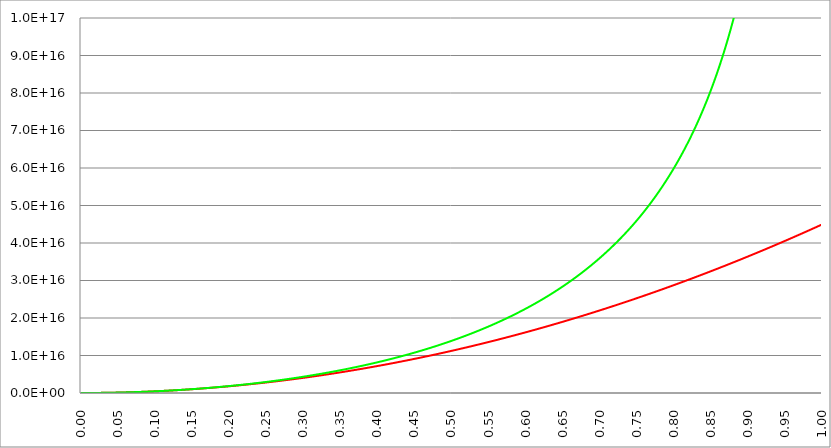
| Category | Series 1 | Series 0 | Series 2 |
|---|---|---|---|
| 0.0 | 0 | 0 |  |
| 0.0005 | 11234439734.21 | 11234441841.178 |  |
| 0.001 | 44937758936.841 | 44937792629.481 |  |
| 0.0015 | 101109957607.892 | 101110128219.087 |  |
| 0.002 | 179751035747.364 | 179751574993.71 |  |
| 0.0025 | 280860993355.255 | 280862309906.519 |  |
| 0.003 | 404439830431.568 | 404442560420.262 |  |
| 0.0035 | 550487546976.301 | 550492604627.008 |  |
| 0.004 | 719004142989.454 | 719012771148.367 |  |
| 0.0045 | 909989618471.028 | 910003439175.398 |  |
| 0.005 | 1123443973421.02 | 1123465038448.66 |  |
| 0.0055 | 1359367207839.44 | 1359398049258.19 |  |
| 0.006 | 1617759321726.27 | 1617803002543.33 |  |
| 0.0065 | 1898620315081.53 | 1898680479733.02 |  |
| 0.007 | 2201950187905.21 | 2202031112885.54 |  |
| 0.0075 | 2527748940197.3 | 2527855584608.65 |  |
| 0.008 | 2876016571957.82 | 2876154628119.5 |  |
| 0.0085 | 3246753083186.76 | 3246929027224.61 |  |
| 0.009 | 3639958473884.11 | 3640179616280.02 |  |
| 0.0095 | 4055632744049.89 | 4055907280330.96 |  |
| 0.01 | 4493775893684.09 | 4494112954972.15 |  |
| 0.0105 | 4954387922786.71 | 4954797626387.7 |  |
| 0.011 | 5437468831357.75 | 5437962331411.04 |  |
| 0.0115 | 5943018619397.21 | 5943608157524.83 |  |
| 0.012 | 6471037286905.09 | 6471736242801.16 |  |
| 0.0125 | 7021524833881.4 | 7022347775981.37 |  |
| 0.013 | 7594481260326.12 | 7595443996416.13 |  |
| 0.0135 | 8189906566239.26 | 8191026194145.31 |  |
| 0.014 | 8807800751620.82 | 8809095709838.12 |  |
| 0.0145 | 9448163816470.81 | 9449653934892.85 |  |
| 0.015 | 10110995760789.2 | 10112702311317.2 |  |
| 0.0155 | 10796296584576 | 10798242331827.9 |  |
| 0.016 | 11504066287831.3 | 11506275539870.9 |  |
| 0.0165 | 12234304870554.9 | 12236803529581.3 |  |
| 0.017 | 12987012332747 | 12989827945763.5 |  |
| 0.0175 | 13762188674407.5 | 13765350484050.6 |  |
| 0.018 | 14559833895536.5 | 14563372890725.1 |  |
| 0.0185 | 15379947996133.8 | 15383896962838.6 |  |
| 0.019 | 16222530976199.6 | 16226924548211.6 |  |
| 0.0195 | 17087582835733.8 | 17092457545453.6 |  |
| 0.02 | 17975103574736.4 | 17980497903943.1 |  |
| 0.0205 | 18885093193207.4 | 18891047623847.5 |  |
| 0.021 | 19817551691146.9 | 19824108756143.4 |  |
| 0.0215 | 20772479068554.7 | 20779683402615.9 |  |
| 0.022 | 21749875325431 | 21757773715919.3 |  |
| 0.0225 | 22749740461775.7 | 22758381899536.6 |  |
| 0.023 | 23772074477588.9 | 23781510207819.6 |  |
| 0.0235 | 24816877372870.4 | 24827160945968.9 |  |
| 0.024 | 25884149147620.4 | 25895336470094 |  |
| 0.0245 | 26973889801838.8 | 26986039187232.8 |  |
| 0.025 | 28086099335525.6 | 28099271555292.1 |  |
| 0.0255 | 29220777748680.8 | 29235036083167.5 |  |
| 0.026 | 30377925041304.5 | 30393335330682.8 |  |
| 0.0265 | 31557541213396.6 | 31574171908590.8 |  |
| 0.027 | 32759626264957 | 32777548478692.5 |  |
| 0.0275 | 33984180195986 | 34003467753757.7 |  |
| 0.028 | 35231203006483.3 | 35251932497564.6 |  |
| 0.0285 | 36500694696449.1 | 36522945524939.6 |  |
| 0.029 | 37792655265883.2 | 37816509701757.9 |  |
| 0.0295 | 39107084714785.8 | 39132627944982.6 |  |
| 0.03 | 40443983043156.8 | 40471303222625.5 |  |
| 0.0305 | 41803350250996.3 | 41832538553806.6 |  |
| 0.031 | 43185186338304.1 | 43216337008853.8 |  |
| 0.0315 | 44589491305080.4 | 44622701709123.8 |  |
| 0.032 | 46016265151325.1 | 46051635827220.8 |  |
| 0.0325 | 47465507877038.2 | 47503142586897.6 |  |
| 0.033 | 48937219482219.8 | 48977225263134.8 |  |
| 0.0335 | 50431399966869.7 | 50473887182081.2 |  |
| 0.034 | 51948049330988.1 | 51993131721233.3 |  |
| 0.0345 | 53487167574574.9 | 53534962309235.8 |  |
| 0.035 | 55048754697630.2 | 55099382426121.2 |  |
| 0.0355 | 56632810700153.8 | 56686395603189.7 |  |
| 0.036 | 58239335582145.9 | 58296005423069.5 |  |
| 0.0365 | 59868329343606.3 | 59928215519756.3 |  |
| 0.037 | 61519791984535.2 | 61583029578633.7 |  |
| 0.0375 | 63193723504932.6 | 63260451336452.7 |  |
| 0.038 | 64890123904798.3 | 64960484581432.2 |  |
| 0.0385 | 66608993184132.5 | 66683133153218.2 |  |
| 0.039 | 68350331342935.1 | 68428400942904.7 |  |
| 0.0395 | 70114138381206.1 | 70196291893152.6 |  |
| 0.04 | 71900414298945.5 | 71986809998050.5 |  |
| 0.0405 | 73709159096153.4 | 73799959303334.3 |  |
| 0.041 | 75540372772829.6 | 75635743906226.9 |  |
| 0.0415 | 77394055328974.3 | 77494167955618.8 |  |
| 0.042 | 79270206764587.4 | 79375235651967.2 |  |
| 0.0425 | 81168827079669 | 81278951247416.8 |  |
| 0.043 | 83089916274218.9 | 83205319045759 |  |
| 0.0435 | 85033474348237.3 | 85154343402552.5 |  |
| 0.044 | 86999501301724.1 | 87126028725022.5 |  |
| 0.0445 | 88987997134679.3 | 89120379472161.4 |  |
| 0.045 | 90998961847103 | 91137400154788.2 |  |
| 0.0455 | 93032395438995 | 93177095335508.8 |  |
| 0.046 | 95088297910355.5 | 95239469628795.5 |  |
| 0.0465 | 97166669261184.3 | 97324527700987.3 |  |
| 0.047 | 99267509491481.6 | 99432274270270 |  |
| 0.0475 | 101390818601247 | 101562714106875 |  |
| 0.048 | 103536596590482 | 103715852032922 |  |
| 0.0485 | 105704843459184 | 105891692922535 |  |
| 0.049 | 107895559207355 | 108090241701845 |  |
| 0.0495 | 110108743834995 | 110311503349089 |  |
| 0.05 | 112344397342102 | 112555482894551 |  |
| 0.0505 | 114602519728679 | 114822185420680 |  |
| 0.051 | 116883110994723 | 117111616061992 |  |
| 0.0515 | 119186171140236 | 119423780005248 |  |
| 0.052 | 121511700165218 | 121758682489455 |  |
| 0.0525 | 123859698069668 | 124116328805786 |  |
| 0.053 | 126230164853586 | 126496724297761 |  |
| 0.0535 | 128623100516973 | 128899874361202 |  |
| 0.054 | 131038505059828 | 131325784444261 |  |
| 0.0545 | 133476378482152 | 133774460047472 |  |
| 0.055 | 135936720783944 | 136245906723857 |  |
| 0.0555 | 138419531965204 | 138740130078801 |  |
| 0.056 | 140924812025933 | 141257135770216 |  |
| 0.0565 | 143452560966131 | 143796929508579 |  |
| 0.057 | 146002778785796 | 146359517056870 |  |
| 0.0575 | 148575465484930 | 148944904230697 |  |
| 0.058 | 151170621063533 | 151553096898312 |  |
| 0.0585 | 153788245521604 | 154184100980610 |  |
| 0.059 | 156428338859143 | 156837922451233 |  |
| 0.0595 | 159090901076151 | 159514567336526 |  |
| 0.06 | 161775932172627 | 162214041715681 |  |
| 0.0605 | 164483432148572 | 164936351720653 |  |
| 0.061 | 167213401003985 | 167681503536300 |  |
| 0.0615 | 169965838738867 | 170449503400367 |  |
| 0.062 | 172740745353217 | 173240357603541 |  |
| 0.0625 | 175538120847035 | 176054072489515 |  |
| 0.063 | 178357965220322 | 178890654454966 |  |
| 0.0635 | 181200278473077 | 181750109949653 |  |
| 0.064 | 184065060605300 | 184632445476461 |  |
| 0.0645 | 186952311616993 | 187537667591397 |  |
| 0.065 | 189862031508153 | 190465782903655 |  |
| 0.0655 | 192794220278782 | 193416798075628 |  |
| 0.066 | 195748877928879 | 196390719823077 |  |
| 0.0665 | 198726004458445 | 199387554914963 |  |
| 0.067 | 201725599867479 | 202407310173673 |  |
| 0.0675 | 204747664155982 | 205449992474995 |  |
| 0.068 | 207792197323953 | 208515608748101 |  |
| 0.0685 | 210859199371392 | 211604165975747 |  |
| 0.069 | 213948670298300 | 214715671194132 |  |
| 0.0695 | 217060610104676 | 217850131493075 |  |
| 0.07 | 220195018790521 | 221007554016022 |  |
| 0.0705 | 223351896355834 | 224187945960098 |  |
| 0.071 | 226531242800615 | 227391314576074 |  |
| 0.0715 | 229733058124865 | 230617667168579 |  |
| 0.072 | 232957342328583 | 233867011095970 |  |
| 0.0725 | 236204095411770 | 237139353770501 |  |
| 0.073 | 239473317374425 | 240434702658311 |  |
| 0.0735 | 242765008216549 | 243753065279482 |  |
| 0.074 | 246079167938141 | 247094449208134 |  |
| 0.0745 | 249415796539201 | 250458862072373 |  |
| 0.075 | 252774894019730 | 253846311554424 |  |
| 0.0755 | 256156460379728 | 257256805390696 |  |
| 0.076 | 259560495619193 | 260690351371698 |  |
| 0.0765 | 262986999738127 | 264146957342280 |  |
| 0.077 | 266435972736530 | 267626631201533 |  |
| 0.0775 | 269907414614401 | 271129380902893 |  |
| 0.078 | 273401325371740 | 274655214454192 |  |
| 0.0785 | 276917705008548 | 278204139917705 |  |
| 0.079 | 280456553524824 | 281776165410250 |  |
| 0.0795 | 284017870920569 | 285371299103103 |  |
| 0.08 | 287601657195782 | 288989549222201 |  |
| 0.0805 | 291207912350464 | 292630924048162 |  |
| 0.081 | 294836636384613 | 296295431916245 |  |
| 0.0815 | 298487829298232 | 299983081216509 |  |
| 0.082 | 302161491091318 | 303693880393812 |  |
| 0.0825 | 305857621763874 | 307427837947874 |  |
| 0.083 | 309576221315897 | 311184962433392 |  |
| 0.0835 | 313317289747389 | 314965262459967 |  |
| 0.084 | 317080827058350 | 318768746692256 |  |
| 0.0845 | 320866833248779 | 322595423850037 |  |
| 0.085 | 324675308318676 | 326445302708208 |  |
| 0.0855 | 328506252268041 | 330318392096845 |  |
| 0.086 | 332359665096876 | 334214700901344 |  |
| 0.0865 | 336235546805178 | 338134238062361 |  |
| 0.087 | 340133897392949 | 342077012575950 |  |
| 0.0875 | 344054716860188 | 346043033493582 |  |
| 0.088 | 347998005206896 | 350032309922230 |  |
| 0.0885 | 351963762433072 | 354044851024423 |  |
| 0.089 | 355951988538717 | 358080666018251 |  |
| 0.0895 | 359962683523830 | 362139764177519 |  |
| 0.09 | 363995847388412 | 366222154831754 |  |
| 0.0905 | 368051480132462 | 370327847366237 |  |
| 0.091 | 372129581755980 | 374456851222130 |  |
| 0.0915 | 376230152258967 | 378609175896472 |  |
| 0.092 | 380353191641422 | 382784830942318 |  |
| 0.0925 | 384498699903345 | 386983825968683 |  |
| 0.093 | 388666677044737 | 391206170640759 |  |
| 0.0935 | 392857123065598 | 395451874679813 |  |
| 0.094 | 397070037965927 | 399720947863371 |  |
| 0.0945 | 401305421745724 | 404013400025256 |  |
| 0.095 | 405563274404990 | 408329241055607 |  |
| 0.0955 | 409843595943724 | 412668480900980 |  |
| 0.096 | 414146386361926 | 417031129564408 |  |
| 0.0965 | 418471645659597 | 421417197105459 |  |
| 0.097 | 422819373836736 | 425826693640320 |  |
| 0.0975 | 427189570893344 | 430259629341811 |  |
| 0.098 | 431582236829420 | 434716014439530 |  |
| 0.0985 | 435997371644965 | 439195859219831 |  |
| 0.099 | 440434975339978 | 443699174026001 |  |
| 0.0995 | 444895047914460 | 448225969258205 |  |
| 0.1 | 449377589368409 | 452776255373624 |  |
| 0.1005 | 453882599701828 | 457350042886511 |  |
| 0.101 | 458410078914715 | 461947342368298 |  |
| 0.1015 | 462960027007070 | 466568164447570 |  |
| 0.102 | 467532443978893 | 471212519810185 |  |
| 0.1025 | 472127329830185 | 475880419199420 |  |
| 0.103 | 476744684560946 | 480571873415901 |  |
| 0.1035 | 481384508171174 | 485286893317754 |  |
| 0.104 | 486046800660872 | 490025489820696 |  |
| 0.1045 | 490731562030037 | 494787673898037 |  |
| 0.105 | 495438792278672 | 499573456580803 |  |
| 0.1055 | 500168491406774 | 504382848957794 |  |
| 0.106 | 504920659414345 | 509215862175642 |  |
| 0.1065 | 509695296301384 | 514072507438932 |  |
| 0.107 | 514492402067892 | 518952796010185 |  |
| 0.1075 | 519311976713868 | 523856739210052 |  |
| 0.108 | 524154020239313 | 528784348417259 |  |
| 0.1085 | 529018532644226 | 533735635068783 |  |
| 0.109 | 533905513928607 | 538710610659895 |  |
| 0.1095 | 538814964092457 | 543709286744198 |  |
| 0.11 | 543746883135776 | 548731674933767 |  |
| 0.1105 | 548701271058562 | 553777786899189 |  |
| 0.111 | 553678127860817 | 558847634369603 |  |
| 0.1115 | 558677453542541 | 563941229132881 |  |
| 0.112 | 563699248103733 | 569058583035565 |  |
| 0.1125 | 568743511544393 | 574199707983089 |  |
| 0.113 | 573810243864522 | 579364615939777 |  |
| 0.1135 | 578899445064119 | 584553318928886 |  |
| 0.114 | 584011115143185 | 589765829032803 |  |
| 0.1145 | 589145254101720 | 595002158392986 |  |
| 0.115 | 594301861939721 | 600262319210143 |  |
| 0.1155 | 599480938657192 | 605546323744333 |  |
| 0.116 | 604682484254132 | 610854184314885 |  |
| 0.1165 | 609906498730540 | 616185913300677 |  |
| 0.117 | 615152982086416 | 621541523140079 |  |
| 0.1175 | 620421934321760 | 626921026331148 |  |
| 0.118 | 625713355436573 | 632324435431614 |  |
| 0.1185 | 631027245430855 | 637751763058931 |  |
| 0.119 | 636363604304605 | 643203021890548 |  |
| 0.1195 | 641722432057823 | 648678224663819 |  |
| 0.12 | 647103728690510 | 654177384176088 |  |
| 0.1205 | 652507494202665 | 659700513284908 |  |
| 0.121 | 657933728594288 | 665247624907999 |  |
| 0.1215 | 663382431865380 | 670818732023371 |  |
| 0.122 | 668853604015941 | 676413847669461 |  |
| 0.1225 | 674347245045969 | 682032984945113 |  |
| 0.123 | 679863354955467 | 687676157009780 |  |
| 0.1235 | 685401933744432 | 693343377083522 |  |
| 0.124 | 690962981412866 | 699034658447185 |  |
| 0.1245 | 696546497960769 | 704750014442366 |  |
| 0.125 | 702152483388140 | 710489458471583 |  |
| 0.1255 | 707780937694979 | 716253003998426 |  |
| 0.126 | 713431860881287 | 722040664547467 |  |
| 0.1265 | 719105252947063 | 727852453704528 |  |
| 0.127 | 724801113892307 | 733688385116655 |  |
| 0.1275 | 730519443717021 | 739548472492261 |  |
| 0.128 | 736260242421202 | 745432729601243 |  |
| 0.1285 | 742023510004852 | 751341170274984 |  |
| 0.129 | 747809246467970 | 757273808406555 |  |
| 0.1295 | 753617451810557 | 763230657950688 |  |
| 0.13 | 759448126032612 | 769211732924022 |  |
| 0.1305 | 765301269134136 | 775217047405021 |  |
| 0.131 | 771176881115127 | 781246615534192 |  |
| 0.1315 | 777074961975588 | 787300451514148 |  |
| 0.132 | 782995511715516 | 793378569609723 |  |
| 0.1325 | 788938530334914 | 799480984147979 |  |
| 0.133 | 794904017833779 | 805607709518419 |  |
| 0.1335 | 800891974212113 | 811758760173009 |  |
| 0.134 | 806902399469916 | 817934150626280 |  |
| 0.1345 | 812935293607187 | 824133895455485 |  |
| 0.135 | 818990656623926 | 830358009300620 |  |
| 0.1355 | 825068488520134 | 836606506864563 |  |
| 0.136 | 831168789295810 | 842879402913154 |  |
| 0.1365 | 837291558950954 | 849176712275317 |  |
| 0.137 | 843436797485568 | 855498449843177 |  |
| 0.1375 | 849604504899650 | 861844630572079 |  |
| 0.138 | 855794681193199 | 868215269480753 |  |
| 0.1385 | 862007326366217 | 874610381651446 |  |
| 0.139 | 868242440418704 | 881029982229909 |  |
| 0.1395 | 874500023350659 | 887474086425633 |  |
| 0.14 | 880780075162082 | 893942709511870 |  |
| 0.1405 | 887082595852974 | 900435866825751 |  |
| 0.141 | 893407585423335 | 906953573768388 |  |
| 0.1415 | 899755043873163 | 913495845804994 |  |
| 0.142 | 906124971202461 | 920062698464979 |  |
| 0.1425 | 912517367411226 | 926654147342036 |  |
| 0.143 | 918932232499460 | 933270208094293 |  |
| 0.1435 | 925369566467163 | 939910896444361 |  |
| 0.144 | 931829369314334 | 946576228179506 |  |
| 0.1445 | 938311641040973 | 953266219151696 |  |
| 0.145 | 944816381647081 | 959980885277714 |  |
| 0.1455 | 951343591132657 | 966720242539305 |  |
| 0.146 | 957893269497701 | 973484306983288 |  |
| 0.1465 | 964465416742214 | 980273094721621 |  |
| 0.147 | 971060032866196 | 987086621931500 |  |
| 0.1475 | 977677117869646 | 993924904855537 |  |
| 0.148 | 984316671752564 | 1000787959801820 |  |
| 0.1485 | 990978694514951 | 1007675803144060 |  |
| 0.149 | 997663186156806 | 1014588451321630 |  |
| 0.1495 | 1004370146678130 | 1021525920839780 |  |
| 0.15 | 1011099576078920 | 1028488228269650 |  |
| 0.1505 | 1017851474359180 | 1035475390248490 |  |
| 0.151 | 1024625841518910 | 1042487423479660 |  |
| 0.1515 | 1031422677558110 | 1049524344732800 |  |
| 0.152 | 1038241982476770 | 1056586170843980 |  |
| 0.1525 | 1045083756274910 | 1063672918715720 |  |
| 0.153 | 1051947998952510 | 1070784605317240 |  |
| 0.1535 | 1058834710509580 | 1077921247684410 |  |
| 0.154 | 1065743890946120 | 1085082862920040 |  |
| 0.1545 | 1072675540262130 | 1092269468193880 |  |
| 0.155 | 1079629658457600 | 1099481080742750 |  |
| 0.1555 | 1086606245532550 | 1106717717870690 |  |
| 0.156 | 1093605301486960 | 1113979396949080 |  |
| 0.1565 | 1100626826320840 | 1121266135416770 |  |
| 0.157 | 1107670820034190 | 1128577950780110 |  |
| 0.1575 | 1114737282627010 | 1135914860613220 |  |
| 0.158 | 1121826214099300 | 1143276882557960 |  |
| 0.1585 | 1128937614451050 | 1150664034324180 |  |
| 0.159 | 1136071483682280 | 1158076333689730 |  |
| 0.1595 | 1143227821792970 | 1165513798500690 |  |
| 0.16 | 1150406628783130 | 1172976446671370 |  |
| 0.1605 | 1157607904652760 | 1180464296184580 |  |
| 0.161 | 1164831649401850 | 1187977365091630 |  |
| 0.1615 | 1172077863030420 | 1195515671512480 |  |
| 0.162 | 1179346545538450 | 1203079233635980 |  |
| 0.1625 | 1186637696925960 | 1210668069719810 |  |
| 0.163 | 1193951317192930 | 1218282198090730 |  |
| 0.1635 | 1201287406339370 | 1225921637144730 |  |
| 0.164 | 1208645964365270 | 1233586405346970 |  |
| 0.1645 | 1216026991270650 | 1241276521232230 |  |
| 0.165 | 1223430487055490 | 1248992003404700 |  |
| 0.1655 | 1230856451719810 | 1256732870538290 |  |
| 0.166 | 1238304885263590 | 1264499141376820 |  |
| 0.1665 | 1245775787686840 | 1272290834733940 |  |
| 0.167 | 1253269158989560 | 1280107969493500 |  |
| 0.1675 | 1260784999171740 | 1287950564609430 |  |
| 0.168 | 1268323308233400 | 1295818639106170 |  |
| 0.1685 | 1275884086174520 | 1303712212078480 |  |
| 0.169 | 1283467332995110 | 1311631302691850 |  |
| 0.1695 | 1291073048695170 | 1319575930182460 |  |
| 0.17 | 1298701233274700 | 1327546113857380 |  |
| 0.1705 | 1306351886733700 | 1335541873094710 |  |
| 0.171 | 1314025009072170 | 1343563227343670 |  |
| 0.1715 | 1321720600290100 | 1351610196124830 |  |
| 0.172 | 1329438660387500 | 1359682799030110 |  |
| 0.1725 | 1337179189364370 | 1367781055723080 |  |
| 0.173 | 1344942187220710 | 1375904985938920 |  |
| 0.1735 | 1352727653956520 | 1384054609484680 |  |
| 0.174 | 1360535589571800 | 1392229946239470 |  |
| 0.1745 | 1368365994066540 | 1400431016154400 |  |
| 0.175 | 1376218867440750 | 1408657839252910 |  |
| 0.1755 | 1384094209694440 | 1416910435630820 |  |
| 0.176 | 1391992020827590 | 1425188825456460 |  |
| 0.1765 | 1399912300840200 | 1433493028970930 |  |
| 0.177 | 1407855049732290 | 1441823066488080 |  |
| 0.1775 | 1415820267503850 | 1450178958394780 |  |
| 0.178 | 1423807954154870 | 1458560725150970 |  |
| 0.1785 | 1431818109685360 | 1466968387289860 |  |
| 0.179 | 1439850734095320 | 1475401965418130 |  |
| 0.1795 | 1447905827384750 | 1483861480215900 |  |
| 0.18 | 1455983389553650 | 1492346952437100 |  |
| 0.1805 | 1464083420602010 | 1500858402909440 |  |
| 0.181 | 1472205920529850 | 1509395852534630 |  |
| 0.1815 | 1480350889337150 | 1517959322288510 |  |
| 0.182 | 1488518327023920 | 1526548833221280 |  |
| 0.1825 | 1496708233590160 | 1535164406457490 |  |
| 0.183 | 1504920609035870 | 1543806063196330 |  |
| 0.1835 | 1513155453361040 | 1552473824711740 |  |
| 0.184 | 1521412766565690 | 1561167712352520 |  |
| 0.1845 | 1529692548649800 | 1569887747542550 |  |
| 0.185 | 1537994799613380 | 1578633951780850 |  |
| 0.1855 | 1546319519456430 | 1587406346641900 |  |
| 0.186 | 1554666708178950 | 1596204953775600 |  |
| 0.1865 | 1563036365780940 | 1605029794907520 |  |
| 0.187 | 1571428492262390 | 1613880891839090 |  |
| 0.1875 | 1579843087623310 | 1622758266447640 |  |
| 0.188 | 1588280151863710 | 1631661940686740 |  |
| 0.1885 | 1596739684983570 | 1640591936586130 |  |
| 0.189 | 1605221686982900 | 1649548276252070 |  |
| 0.1895 | 1613726157861690 | 1658530981867440 |  |
| 0.19 | 1622253097619960 | 1667540075691800 |  |
| 0.1905 | 1630802506257690 | 1676575580061740 |  |
| 0.191 | 1639374383774890 | 1685637517390850 |  |
| 0.1915 | 1647968730171570 | 1694725910169990 |  |
| 0.192 | 1656585545447700 | 1703840780967460 |  |
| 0.1925 | 1665224829603310 | 1712982152429140 |  |
| 0.193 | 1673886582638390 | 1722150047278580 |  |
| 0.1935 | 1682570804552930 | 1731344488317270 |  |
| 0.194 | 1691277495346950 | 1740565498424810 |  |
| 0.1945 | 1700006655020430 | 1749813100558950 |  |
| 0.195 | 1708758283573380 | 1759087317755890 |  |
| 0.1955 | 1717532381005800 | 1768388173130360 |  |
| 0.196 | 1726328947317680 | 1777715689875860 |  |
| 0.1965 | 1735147982509040 | 1787069891264770 |  |
| 0.197 | 1743989486579860 | 1796450800648560 |  |
| 0.1975 | 1752853459530150 | 1805858441457880 |  |
| 0.198 | 1761739901359910 | 1815292837202890 |  |
| 0.1985 | 1770648812069140 | 1824754011473240 |  |
| 0.199 | 1779580191657840 | 1834241987938390 |  |
| 0.1995 | 1788534040126000 | 1843756790347690 |  |
| 0.2 | 1797510357473640 | 1853298442530600 |  |
| 0.2005 | 1806509143700740 | 1862866968396870 |  |
| 0.201 | 1815530398807310 | 1872462391936690 |  |
| 0.2015 | 1824574122793350 | 1882084737220890 |  |
| 0.202 | 1833640315658860 | 1891734028401030 |  |
| 0.2025 | 1842728977403830 | 1901410289709740 |  |
| 0.203 | 1851840108028280 | 1911113545460780 |  |
| 0.2035 | 1860973707532190 | 1920843820049200 |  |
| 0.204 | 1870129775915570 | 1930601137951610 |  |
| 0.2045 | 1879308313178420 | 1940385523726290 |  |
| 0.205 | 1888509319320740 | 1950197002013400 |  |
| 0.2055 | 1897732794342530 | 1960035597535160 |  |
| 0.206 | 1906978738243780 | 1969901335096020 |  |
| 0.2065 | 1916247151024510 | 1979794239582870 |  |
| 0.207 | 1925538032684700 | 1989714335965170 |  |
| 0.2075 | 1934851383224360 | 1999661649295190 |  |
| 0.208 | 1944187202643490 | 2009636204708170 |  |
| 0.2085 | 1953545490942080 | 2019638027422530 |  |
| 0.209 | 1962926248120150 | 2029667142739990 |  |
| 0.2095 | 1972329474177680 | 2039723576045860 |  |
| 0.21 | 1981755169114690 | 2049807352809110 |  |
| 0.2105 | 1991203332931160 | 2059918498582700 |  |
| 0.211 | 2000673965627100 | 2070057039003600 |  |
| 0.2115 | 2010167067202500 | 2080222999793160 |  |
| 0.212 | 2019682637657380 | 2090416406757140 |  |
| 0.2125 | 2029220676991720 | 2100637285786060 |  |
| 0.213 | 2038781185205540 | 2110885662855210 |  |
| 0.2135 | 2048364162298820 | 2121161564024990 |  |
| 0.214 | 2057969608271570 | 2131465015441110 |  |
| 0.2145 | 2067597523123790 | 2141796043334620 |  |
| 0.215 | 2077247906855470 | 2152154674022320 |  |
| 0.2155 | 2086920759466630 | 2162540933906770 |  |
| 0.216 | 2096616080957250 | 2172954849476690 |  |
| 0.2165 | 2106333871327340 | 2183396447306910 |  |
| 0.217 | 2116074130576900 | 2193865754058790 |  |
| 0.2175 | 2125836858705930 | 2204362796480280 |  |
| 0.218 | 2135622055714430 | 2214887601406220 |  |
| 0.2185 | 2145429721602390 | 2225440195758450 |  |
| 0.219 | 2155259856369830 | 2236020606546100 |  |
| 0.2195 | 2165112460016730 | 2246628860865740 |  |
| 0.22 | 2174987532543100 | 2257264985901530 |  |
| 0.2205 | 2184885073948940 | 2267929008925580 |  |
| 0.221 | 2194805084234250 | 2278620957298040 |  |
| 0.2215 | 2204747563399020 | 2289340858467310 |  |
| 0.222 | 2214712511443270 | 2300088739970290 |  |
| 0.2225 | 2224699928366980 | 2310864629432560 |  |
| 0.223 | 2234709814170160 | 2321668554568610 |  |
| 0.2235 | 2244742168852810 | 2332500543182040 |  |
| 0.224 | 2254796992414930 | 2343360623165730 |  |
| 0.2245 | 2264874284856520 | 2354248822502140 |  |
| 0.225 | 2274974046177570 | 2365165169263480 |  |
| 0.2255 | 2285096276378100 | 2376109691611900 |  |
| 0.226 | 2295240975458090 | 2387082417799700 |  |
| 0.2265 | 2305408143417550 | 2398083376169590 |  |
| 0.227 | 2315597780256480 | 2409112595154890 |  |
| 0.2275 | 2325809885974870 | 2420170103279750 |  |
| 0.228 | 2336044460572740 | 2431255929159350 |  |
| 0.2285 | 2346301504050070 | 2442370101500100 |  |
| 0.229 | 2356581016406880 | 2453512649099980 |  |
| 0.2295 | 2366882997643150 | 2464683600848530 |  |
| 0.23 | 2377207447758890 | 2475882985727340 |  |
| 0.2305 | 2387554366754090 | 2487110832810100 |  |
| 0.231 | 2397923754628770 | 2498367171262830 |  |
| 0.2315 | 2408315611382910 | 2509652030344190 |  |
| 0.232 | 2418729937016530 | 2520965439405620 |  |
| 0.2325 | 2429166731529610 | 2532307427891660 |  |
| 0.233 | 2439625994922160 | 2543678025340070 |  |
| 0.2335 | 2450107727194180 | 2555077261382140 |  |
| 0.234 | 2460611928345660 | 2566505165742850 |  |
| 0.2345 | 2471138598376620 | 2577961768241160 |  |
| 0.235 | 2481687737287040 | 2589447098790220 |  |
| 0.2355 | 2492259345076930 | 2600961187397620 |  |
| 0.236 | 2502853421746290 | 2612504064165580 |  |
| 0.2365 | 2513469967295120 | 2624075759291190 |  |
| 0.237 | 2524108981723420 | 2635676303066680 |  |
| 0.2375 | 2534770465031190 | 2647305725879640 |  |
| 0.238 | 2545454417218420 | 2658964058213290 |  |
| 0.2385 | 2556160838285120 | 2670651330646580 |  |
| 0.239 | 2566889728231290 | 2682367573854640 |  |
| 0.2395 | 2577641087056930 | 2694112818608830 |  |
| 0.24 | 2588414914762040 | 2705887095777090 |  |
| 0.2405 | 2599211211346610 | 2717690436324160 |  |
| 0.241 | 2610029976810660 | 2729522871311830 |  |
| 0.2415 | 2620871211154170 | 2741384431899100 |  |
| 0.242 | 2631734914377150 | 2753275149342540 |  |
| 0.2425 | 2642621086479600 | 2765195054996470 |  |
| 0.243 | 2653529727461520 | 2777144180313260 |  |
| 0.2435 | 2664460837322910 | 2789122556843450 |  |
| 0.244 | 2675414416063760 | 2801130216236170 |  |
| 0.2445 | 2686390463684090 | 2813167190239320 |  |
| 0.245 | 2697388980183880 | 2825233510699730 |  |
| 0.2455 | 2708409965563140 | 2837329209563530 |  |
| 0.246 | 2719453419821870 | 2849454318876350 |  |
| 0.2465 | 2730519342960060 | 2861608870783620 |  |
| 0.247 | 2741607734977730 | 2873792897530770 |  |
| 0.2475 | 2752718595874860 | 2886006431463450 |  |
| 0.248 | 2763851925651470 | 2898249505027940 |  |
| 0.2485 | 2775007724307540 | 2910522150771220 |  |
| 0.249 | 2786185991843080 | 2922824401341360 |  |
| 0.2495 | 2797386728258080 | 2935156289487750 |  |
| 0.25 | 2808609933552560 | 2947517848061310 |  |
| 0.2505 | 2819855607726500 | 2959909110014810 |  |
| 0.251 | 2831123750779920 | 2972330108403090 |  |
| 0.2515 | 2842414362712800 | 2984780876383390 |  |
| 0.252 | 2853727443525150 | 2997261447215550 |  |
| 0.2525 | 2865062993216970 | 3009771854262250 |  |
| 0.253 | 2876421011788250 | 3022312130989390 |  |
| 0.2535 | 2887801499239010 | 3034882310966280 |  |
| 0.254 | 2899204455569230 | 3047482427865880 |  |
| 0.2545 | 2910629880778920 | 3060112515465150 |  |
| 0.255 | 2922077774868080 | 3072772607645270 |  |
| 0.2555 | 2933548137836710 | 3085462738391940 |  |
| 0.256 | 2945040969684810 | 3098182941795610 |  |
| 0.2565 | 2956556270412370 | 3110933252051800 |  |
| 0.257 | 2968094040019410 | 3123713703461350 |  |
| 0.2575 | 2979654278505910 | 3136524330430750 |  |
| 0.258 | 2991236985871880 | 3149365167472310 |  |
| 0.2585 | 3002842162117320 | 3162236249204550 |  |
| 0.259 | 3014469807242230 | 3175137610352420 |  |
| 0.2595 | 3026119921246600 | 3188069285747590 |  |
| 0.26 | 3037792504130450 | 3201031310328750 |  |
| 0.2605 | 3049487555893760 | 3214023719141880 |  |
| 0.261 | 3061205076536540 | 3227046547340520 |  |
| 0.2615 | 3072945066058790 | 3240099830186120 |  |
| 0.262 | 3084707524460510 | 3253183603048220 |  |
| 0.2625 | 3096492451741700 | 3266297901404830 |  |
| 0.263 | 3108299847902350 | 3279442760842720 |  |
| 0.2635 | 3120129712942470 | 3292618217057620 |  |
| 0.264 | 3131982046862070 | 3305824305854620 |  |
| 0.2645 | 3143856849661130 | 3319061063148370 |  |
| 0.265 | 3155754121339660 | 3332328524963480 |  |
| 0.2655 | 3167673861897650 | 3345626727434680 |  |
| 0.266 | 3179616071335120 | 3358955706807280 |  |
| 0.2665 | 3191580749652050 | 3372315499437320 |  |
| 0.267 | 3203567896848450 | 3385706141791920 |  |
| 0.2675 | 3215577512924320 | 3399127670449650 |  |
| 0.268 | 3227609597879660 | 3412580122100690 |  |
| 0.2685 | 3239664151714470 | 3426063533547300 |  |
| 0.269 | 3251741174428750 | 3439577941703980 |  |
| 0.2695 | 3263840666022490 | 3453123383597850 |  |
| 0.27 | 3275962626495700 | 3466699896368950 |  |
| 0.2705 | 3288107055848390 | 3480307517270530 |  |
| 0.271 | 3300273954080540 | 3493946283669360 |  |
| 0.2715 | 3312463321192150 | 3507616233046060 |  |
| 0.272 | 3324675157183240 | 3521317402995390 |  |
| 0.2725 | 3336909462053800 | 3535049831226570 |  |
| 0.273 | 3349166235803820 | 3548813555563620 |  |
| 0.2735 | 3361445478433310 | 3562608613945660 |  |
| 0.274 | 3373747189942270 | 3576435044427160 |  |
| 0.2745 | 3386071370330700 | 3590292885178340 |  |
| 0.275 | 3398418019598600 | 3604182174485520 |  |
| 0.2755 | 3410787137745960 | 3618102950751300 |  |
| 0.276 | 3423178724772800 | 3632055252495070 |  |
| 0.2765 | 3435592780679100 | 3646039118353140 |  |
| 0.277 | 3448029305464870 | 3660054587079210 |  |
| 0.2775 | 3460488299130110 | 3674101697544630 |  |
| 0.278 | 3472969761674820 | 3688180488738730 |  |
| 0.2785 | 3485473693098990 | 3702290999769160 |  |
| 0.279 | 3498000093402640 | 3716433269862220 |  |
| 0.2795 | 3510548962585750 | 3730607338363220 |  |
| 0.28 | 3523120300648330 | 3744813244736750 |  |
| 0.2805 | 3535714107590380 | 3759051028567040 |  |
| 0.281 | 3548330383411900 | 3773320729558330 |  |
| 0.2815 | 3560969128112880 | 3787622387535190 |  |
| 0.282 | 3573630341693340 | 3801956042442800 |  |
| 0.2825 | 3586314024153260 | 3816321734347350 |  |
| 0.283 | 3599020175492650 | 3830719503436400 |  |
| 0.2835 | 3611748795711510 | 3845149390019160 |  |
| 0.284 | 3624499884809840 | 3859611434526870 |  |
| 0.2845 | 3637273442787640 | 3874105677513170 |  |
| 0.285 | 3650069469644910 | 3888632159654340 |  |
| 0.2855 | 3662887965381640 | 3903190921749810 |  |
| 0.286 | 3675728929997840 | 3917782004722380 |  |
| 0.2865 | 3688592363493510 | 3932405449618610 |  |
| 0.287 | 3701478265868650 | 3947061297609190 |  |
| 0.2875 | 3714386637123260 | 3961749589989260 |  |
| 0.288 | 3727317477257340 | 3976470368178840 |  |
| 0.2885 | 3740270786270880 | 3991223673723050 |  |
| 0.289 | 3753246564163890 | 4006009548292620 |  |
| 0.2895 | 3766244810936370 | 4020828033684140 |  |
| 0.29 | 3779265526588320 | 4035679171820490 |  |
| 0.2905 | 3792308711119740 | 4050563004751150 |  |
| 0.291 | 3805374364530630 | 4065479574652580 |  |
| 0.2915 | 3818462486820980 | 4080428923828640 |  |
| 0.292 | 3831573077990810 | 4095411094710870 |  |
| 0.2925 | 3844706138040100 | 4110426129858890 |  |
| 0.293 | 3857861666968860 | 4125474071960800 |  |
| 0.2935 | 3871039664777090 | 4140554963833560 |  |
| 0.294 | 3884240131464780 | 4155668848423270 |  |
| 0.2945 | 3897463067031950 | 4170815768805660 |  |
| 0.295 | 3910708471478580 | 4185995768186400 |  |
| 0.2955 | 3923976344804690 | 4201208889901480 |  |
| 0.296 | 3937266687010260 | 4216455177417610 |  |
| 0.2965 | 3950579498095300 | 4231734674332600 |  |
| 0.297 | 3963914778059800 | 4247047424375740 |  |
| 0.2975 | 3977272526903780 | 4262393471408170 |  |
| 0.298 | 3990652744627220 | 4277772859423270 |  |
| 0.2985 | 4004055431230140 | 4293185632547080 |  |
| 0.299 | 4017480586712520 | 4308631835038620 |  |
| 0.2995 | 4030928211074370 | 4324111511290380 |  |
| 0.3 | 4044398304315680 | 4339624705828560 |  |
| 0.3005 | 4057890866436470 | 4355171463313710 |  |
| 0.301 | 4071405897436730 | 4370751828540840 |  |
| 0.3015 | 4084943397316450 | 4386365846439980 |  |
| 0.302 | 4098503366075640 | 4402013562076600 |  |
| 0.3025 | 4112085803714300 | 4417695020651910 |  |
| 0.303 | 4125690710232430 | 4433410267503330 |  |
| 0.3035 | 4139318085630030 | 4449159348104900 |  |
| 0.304 | 4152967929907090 | 4464942308067630 |  |
| 0.3045 | 4166640243063630 | 4480759193139900 |  |
| 0.305 | 4180335025099630 | 4496610049208050 |  |
| 0.3055 | 4194052276015100 | 4512494922296460 |  |
| 0.306 | 4207791995810040 | 4528413858568310 |  |
| 0.3065 | 4221554184484450 | 4544366904325740 |  |
| 0.307 | 4235338842038320 | 4560354106010410 |  |
| 0.3075 | 4249145968471670 | 4576375510203820 |  |
| 0.308 | 4262975563784480 | 4592431163627840 |  |
| 0.3085 | 4276827627976760 | 4608521113144980 |  |
| 0.309 | 4290702161048510 | 4624645405759010 |  |
| 0.3095 | 4304599162999730 | 4640804088615180 |  |
| 0.31 | 4318518633830410 | 4656997209000800 |  |
| 0.3105 | 4332460573540570 | 4673224814345580 |  |
| 0.311 | 4346424982130190 | 4689486952222080 |  |
| 0.3115 | 4360411859599280 | 4705783670346200 |  |
| 0.312 | 4374421205947850 | 4722115016577480 |  |
| 0.3125 | 4388453021175870 | 4738481038919720 |  |
| 0.313 | 4402507305283370 | 4754881785521250 |  |
| 0.3135 | 4416584058270340 | 4771317304675430 |  |
| 0.314 | 4430683280136770 | 4787787644821130 |  |
| 0.3145 | 4444804970882670 | 4804292854543130 |  |
| 0.315 | 4458949130508040 | 4820832982572560 |  |
| 0.3155 | 4473115759012880 | 4837408077787340 |  |
| 0.316 | 4487304856397190 | 4854018189212720 |  |
| 0.3165 | 4501516422660970 | 4870663366021590 |  |
| 0.317 | 4515750457804210 | 4887343657534990 |  |
| 0.3175 | 4530006961826920 | 4904059113222620 |  |
| 0.318 | 4544285934729100 | 4920809782703230 |  |
| 0.3185 | 4558587376510750 | 4937595715745110 |  |
| 0.319 | 4572911287171870 | 4954416962266500 |  |
| 0.3195 | 4587257666712460 | 4971273572336140 |  |
| 0.32 | 4601626515132510 | 4988165596173580 |  |
| 0.3205 | 4616017832432040 | 5005093084149900 |  |
| 0.321 | 4630431618611030 | 5022056086787880 |  |
| 0.3215 | 4644867873669490 | 5039054654762710 |  |
| 0.322 | 4659326597607420 | 5056088838902320 |  |
| 0.3225 | 4673807790424810 | 5073158690187880 |  |
| 0.323 | 4688311452121680 | 5090264259754350 |  |
| 0.3235 | 4702837582698010 | 5107405598890850 |  |
| 0.324 | 4717386182153810 | 5124582759041210 |  |
| 0.3245 | 4731957250489090 | 5141795791804460 |  |
| 0.325 | 4746550787703820 | 5159044748935220 |  |
| 0.3255 | 4761166793798030 | 5176329682344290 |  |
| 0.326 | 4775805268771710 | 5193650644099130 |  |
| 0.3265 | 4790466212624850 | 5211007686424240 |  |
| 0.327 | 4805149625357460 | 5228400861701830 |  |
| 0.3275 | 4819855506969550 | 5245830222472080 |  |
| 0.328 | 4834583857461100 | 5263295821433920 |  |
| 0.3285 | 4849334676832110 | 5280797711445240 |  |
| 0.329 | 4864107965082600 | 5298335945523630 |  |
| 0.3295 | 4878903722212560 | 5315910576846750 |  |
| 0.33 | 4893721948221980 | 5333521658752820 |  |
| 0.3305 | 4908562643110870 | 5351169244741220 |  |
| 0.331 | 4923425806879230 | 5368853388472940 |  |
| 0.3315 | 4938311439527060 | 5386574143771110 |  |
| 0.332 | 4953219541054360 | 5404331564621490 |  |
| 0.3325 | 4968150111461120 | 5422125705172970 |  |
| 0.333 | 4983103150747350 | 5439956619738170 |  |
| 0.3335 | 4998078658913060 | 5457824362793890 |  |
| 0.334 | 5013076635958230 | 5475728988981620 |  |
| 0.3345 | 5028097081882870 | 5493670553108140 |  |
| 0.335 | 5043139996686970 | 5511649110145950 |  |
| 0.3355 | 5058205380370550 | 5529664715233890 |  |
| 0.336 | 5073293232933590 | 5547717423677600 |  |
| 0.3365 | 5088403554376110 | 5565807290950100 |  |
| 0.337 | 5103536344698090 | 5583934372692270 |  |
| 0.3375 | 5118691603899540 | 5602098724713500 |  |
| 0.338 | 5133869331980460 | 5620300402992090 |  |
| 0.3385 | 5149069528940840 | 5638539463675880 |  |
| 0.339 | 5164292194780700 | 5656815963082770 |  |
| 0.3395 | 5179537329500020 | 5675129957701230 |  |
| 0.34 | 5194804933098810 | 5693481504191010 |  |
| 0.3405 | 5210095005577070 | 5711870659383440 |  |
| 0.341 | 5225407546934800 | 5730297480282170 |  |
| 0.3415 | 5240742557172000 | 5748762024063660 |  |
| 0.342 | 5256100036288660 | 5767264348077800 |  |
| 0.3425 | 5271479984284800 | 5785804509848340 |  |
| 0.343 | 5286882401160400 | 5804382567073590 |  |
| 0.3435 | 5302307286915470 | 5822998577626930 |  |
| 0.344 | 5317754641550010 | 5841652599557380 |  |
| 0.3445 | 5333224465064020 | 5860344691090160 |  |
| 0.345 | 5348716757457490 | 5879074910627250 |  |
| 0.3455 | 5364231518730440 | 5897843316748100 |  |
| 0.346 | 5379768748882850 | 5916649968209950 |  |
| 0.3465 | 5395328447914730 | 5935494923948680 |  |
| 0.347 | 5410910615826080 | 5954378243079240 |  |
| 0.3475 | 5426515252616900 | 5973299984896240 |  |
| 0.348 | 5442142358287190 | 5992260208874630 |  |
| 0.3485 | 5457791932836940 | 6011258974670170 |  |
| 0.349 | 5473463976266160 | 6030296342120160 |  |
| 0.3495 | 5489158488574860 | 6049372371243900 |  |
| 0.35 | 5504875469763020 | 6068487122243380 |  |
| 0.3505 | 5520614919830640 | 6087640655503870 |  |
| 0.351 | 5536376838777740 | 6106833031594460 |  |
| 0.3515 | 5552161226604310 | 6126064311268750 |  |
| 0.352 | 5567968083310340 | 6145334555465440 |  |
| 0.3525 | 5583797408895840 | 6164643825308870 |  |
| 0.353 | 5599649203360810 | 6183992182109800 |  |
| 0.3535 | 5615523466705250 | 6203379687365770 |  |
| 0.354 | 5631420198929160 | 6222806402762000 |  |
| 0.3545 | 5647339400032540 | 6242272390171830 |  |
| 0.355 | 5663281070015380 | 6261777711657420 |  |
| 0.3555 | 5679245208877690 | 6281322429470300 |  |
| 0.356 | 5695231816619470 | 6300906606052170 |  |
| 0.3565 | 5711240893240720 | 6320530304035300 |  |
| 0.357 | 5727272438741440 | 6340193586243370 |  |
| 0.3575 | 5743326453121630 | 6359896515692020 |  |
| 0.358 | 5759402936381280 | 6379639155589460 |  |
| 0.3585 | 5775501888520410 | 6399421569337270 |  |
| 0.359 | 5791623309539000 | 6419243820530760 |  |
| 0.3595 | 5807767199437060 | 6439105972959960 |  |
| 0.36 | 5823933558214590 | 6459008090610030 |  |
| 0.3605 | 5840122385871580 | 6478950237662040 |  |
| 0.361 | 5856333682408050 | 6498932478493510 |  |
| 0.3615 | 5872567447823980 | 6518954877679270 |  |
| 0.362 | 5888823682119390 | 6539017499991900 |  |
| 0.3625 | 5905102385294260 | 6559120410402560 |  |
| 0.363 | 5921403557348590 | 6579263674081600 |  |
| 0.3635 | 5937727198282400 | 6599447356399230 |  |
| 0.364 | 5954073308095680 | 6619671522926210 |  |
| 0.3645 | 5970441886788420 | 6639936239434550 |  |
| 0.365 | 5986832934360630 | 6660241571898150 |  |
| 0.3655 | 6003246450812320 | 6680587586493490 |  |
| 0.366 | 6019682436143460 | 6700974349600380 |  |
| 0.3665 | 6036140890354080 | 6721401927802610 |  |
| 0.367 | 6052621813444170 | 6741870387888600 |  |
| 0.3675 | 6069125205413730 | 6762379796852200 |  |
| 0.368 | 6085651066262750 | 6782930221893320 |  |
| 0.3685 | 6102199395991240 | 6803521730418600 |  |
| 0.369 | 6118770194599200 | 6824154390042240 |  |
| 0.3695 | 6135363462086630 | 6844828268586660 |  |
| 0.37 | 6151979198453530 | 6865543434083100 |  |
| 0.3705 | 6168617403699890 | 6886299954772510 |  |
| 0.371 | 6185278077825720 | 6907097899106170 |  |
| 0.3715 | 6201961220831030 | 6927937335746450 |  |
| 0.372 | 6218666832715800 | 6948818333567510 |  |
| 0.3725 | 6235394913480040 | 6969740961656080 |  |
| 0.373 | 6252145463123740 | 6990705289312110 |  |
| 0.3735 | 6268918481646920 | 7011711386049620 |  |
| 0.374 | 6285713969049560 | 7032759321597320 |  |
| 0.3745 | 6302531925331680 | 7053849165899450 |  |
| 0.375 | 6319372350493260 | 7074980989116480 |  |
| 0.3755 | 6336235244534310 | 7096154861625880 |  |
| 0.376 | 6353120607454820 | 7117370854022850 |  |
| 0.3765 | 6370028439254810 | 7138629037121090 |  |
| 0.377 | 6386958739934270 | 7159929481953590 |  |
| 0.3775 | 6403911509493190 | 7181272259773340 |  |
| 0.378 | 6420886747931580 | 7202657442054110 |  |
| 0.3785 | 6437884455249440 | 7224085100491290 |  |
| 0.379 | 6454904631446770 | 7245555307002570 |  |
| 0.3795 | 6471947276523570 | 7267068133728760 |  |
| 0.38 | 6489012390479830 | 7288623653034580 |  |
| 0.3805 | 6506099973315570 | 7310221937509440 |  |
| 0.381 | 6523210025030770 | 7331863059968220 |  |
| 0.3815 | 6540342545625440 | 7353547093452060 |  |
| 0.382 | 6557497535099580 | 7375274111229160 |  |
| 0.3825 | 6574674993453190 | 7397044186795610 |  |
| 0.383 | 6591874920686260 | 7418857393876120 |  |
| 0.3835 | 6609097316798810 | 7440713806424900 |  |
| 0.384 | 6626342181790820 | 7462613498626450 |  |
| 0.3845 | 6643609515662300 | 7484556544896340 |  |
| 0.385 | 6660899318413250 | 7506543019882080 |  |
| 0.3855 | 6678211590043670 | 7528572998463900 |  |
| 0.386 | 6695546330553550 | 7550646555755590 |  |
| 0.3865 | 6712903539942910 | 7572763767105340 |  |
| 0.387 | 6730283218211730 | 7594924708096570 |  |
| 0.3875 | 6747685365360020 | 7617129454548760 |  |
| 0.388 | 6765109981387780 | 7639378082518240 |  |
| 0.3885 | 6782557066295010 | 7661670668299150 |  |
| 0.389 | 6800026620081710 | 7684007288424220 |  |
| 0.3895 | 6817518642747870 | 7706388019665580 |  |
| 0.39 | 6835033134293510 | 7728812939035700 |  |
| 0.3905 | 6852570094718610 | 7751282123788190 |  |
| 0.391 | 6870129524023180 | 7773795651418710 |  |
| 0.3915 | 6887711422207220 | 7796353599665770 |  |
| 0.392 | 6905315789270730 | 7818956046511720 |  |
| 0.3925 | 6922942625213700 | 7841603070183480 |  |
| 0.393 | 6940591930036150 | 7864294749153500 |  |
| 0.3935 | 6958263703738060 | 7887031162140680 |  |
| 0.394 | 6975957946319440 | 7909812388111190 |  |
| 0.3945 | 6993674657780290 | 7932638506279360 |  |
| 0.395 | 7011413838120610 | 7955509596108670 |  |
| 0.3955 | 7029175487340400 | 7978425737312500 |  |
| 0.396 | 7046959605439650 | 8001387009855160 |  |
| 0.3965 | 7064766192418370 | 8024393493952790 |  |
| 0.397 | 7082595248276570 | 8047445270074160 |  |
| 0.3975 | 7100446773014220 | 8070542418941750 |  |
| 0.398 | 7118320766631350 | 8093685021532540 |  |
| 0.3985 | 7136217229127950 | 8116873159078960 |  |
| 0.399 | 7154136160504010 | 8140106913069920 |  |
| 0.3995 | 7172077560759550 | 8163386365251620 |  |
| 0.4 | 7190041429894550 | 8186711597628540 |  |
| 0.4005 | 7208027767909020 | 8210082692464400 |  |
| 0.401 | 7226036574802960 | 8233499732283070 |  |
| 0.4015 | 7244067850576370 | 8256962799869540 |  |
| 0.402 | 7262121595229250 | 8280471978270910 |  |
| 0.4025 | 7280197808761590 | 8304027350797290 |  |
| 0.403 | 7298296491173400 | 8327629001022780 |  |
| 0.4035 | 7316417642464680 | 8351277012786490 |  |
| 0.404 | 7334561262635430 | 8374971470193470 |  |
| 0.4045 | 7352727351685650 | 8398712457615660 |  |
| 0.405 | 7370915909615340 | 8422500059692990 |  |
| 0.4055 | 7389126936424490 | 8446334361334210 |  |
| 0.406 | 7407360432113110 | 8470215447718000 |  |
| 0.4065 | 7425616396681210 | 8494143404293920 |  |
| 0.407 | 7443894830128770 | 8518118316783450 |  |
| 0.4075 | 7462195732455790 | 8542140271180940 |  |
| 0.408 | 7480519103662290 | 8566209353754640 |  |
| 0.4085 | 7498864943748260 | 8590325651047790 |  |
| 0.409 | 7517233252713690 | 8614489249879510 |  |
| 0.4095 | 7535624030558590 | 8638700237345930 |  |
| 0.41 | 7554037277282960 | 8662958700821180 |  |
| 0.4105 | 7572472992886800 | 8687264727958440 |  |
| 0.411 | 7590931177370110 | 8711618406690960 |  |
| 0.4115 | 7609411830732890 | 8736019825233140 |  |
| 0.412 | 7627914952975130 | 8760469072081540 |  |
| 0.4125 | 7646440544096840 | 8784966236016000 |  |
| 0.413 | 7664988604098020 | 8809511406100560 |  |
| 0.4135 | 7683559132978670 | 8834104671684720 |  |
| 0.414 | 7702152130738790 | 8858746122404400 |  |
| 0.4145 | 7720767597378380 | 8883435848182950 |  |
| 0.415 | 7739405532897430 | 8908173939232420 |  |
| 0.4155 | 7758065937295960 | 8932960486054480 |  |
| 0.416 | 7776748810573950 | 8957795579441530 |  |
| 0.4165 | 7795454152731410 | 8982679310477930 |  |
| 0.417 | 7814181963768340 | 9007611770540910 |  |
| 0.4175 | 7832932243684730 | 9032593051301860 |  |
| 0.418 | 7851704992480600 | 9057623244727260 |  |
| 0.4185 | 7870500210155930 | 9082702443079990 |  |
| 0.419 | 7889317896710730 | 9107830738920330 |  |
| 0.4195 | 7908158052145000 | 9133008225107070 |  |
| 0.42 | 7927020676458740 | 9158234994798720 |  |
| 0.4205 | 7945905769651950 | 9183511141454620 |  |
| 0.421 | 7964813331724630 | 9208836758836110 |  |
| 0.4215 | 7983743362676770 | 9234211941007590 |  |
| 0.422 | 8002695862508380 | 9259636782337810 |  |
| 0.4225 | 8021670831219470 | 9285111377500920 |  |
| 0.423 | 8040668268810010 | 9310635821477700 |  |
| 0.4235 | 8059688175280030 | 9336210209556640 |  |
| 0.424 | 8078730550629520 | 9361834637335310 |  |
| 0.4245 | 8097795394858470 | 9387509200721350 |  |
| 0.425 | 8116882707966900 | 9413233995933760 |  |
| 0.4255 | 8135992489954790 | 9439009119504010 |  |
| 0.426 | 8155124740822150 | 9464834668277390 |  |
| 0.4265 | 8174279460568980 | 9490710739414050 |  |
| 0.427 | 8193456649195270 | 9516637430390370 |  |
| 0.4275 | 8212656306701040 | 9542614839000020 |  |
| 0.428 | 8231878433086270 | 9568643063355300 |  |
| 0.4285 | 8251123028350970 | 9594722201888350 |  |
| 0.429 | 8270390092495140 | 9620852353352370 |  |
| 0.4295 | 8289679625518780 | 9647033616822810 |  |
| 0.43 | 8308991627421890 | 9673266091698770 |  |
| 0.4305 | 8328326098204470 | 9699549877704090 |  |
| 0.431 | 8347683037866510 | 9725885074888680 |  |
| 0.4315 | 8367062446408020 | 9752271783629800 |  |
| 0.432 | 8386464323829000 | 9778710104633370 |  |
| 0.4325 | 8405888670129460 | 9805200138935110 |  |
| 0.433 | 8425335485309370 | 9831741987902010 |  |
| 0.4335 | 8444804769368760 | 9858335753233450 |  |
| 0.434 | 8464296522307610 | 9884981536962630 |  |
| 0.4345 | 8483810744125940 | 9911679441457810 |  |
| 0.435 | 8503347434823730 | 9938429569423660 |  |
| 0.4355 | 8522906594400990 | 9965232023902460 |  |
| 0.436 | 8542488222857720 | 9992086908275630 |  |
| 0.4365 | 8562092320193910 | 10018994326264900 |  |
| 0.437 | 8581718886409580 | 10045954381933600 |  |
| 0.4375 | 8601367921504710 | 10072967179688400 |  |
| 0.438 | 8621039425479320 | 10100032824280000 |  |
| 0.4385 | 8640733398333380 | 10127151420805100 |  |
| 0.439 | 8660449840066920 | 10154323074707300 |  |
| 0.4395 | 8680188750679930 | 10181547891778900 |  |
| 0.44 | 8699950130172410 | 10208825978161900 |  |
| 0.4405 | 8719733978544350 | 10236157440349700 |  |
| 0.441 | 8739540295795760 | 10263542385188300 |  |
| 0.4415 | 8759369081926650 | 10290980919877500 |  |
| 0.442 | 8779220336936990 | 10318473151972800 |  |
| 0.4425 | 8799094060826810 | 10346019189386500 |  |
| 0.443 | 8818990253596100 | 10373619140389200 |  |
| 0.4435 | 8838908915244850 | 10401273113611100 |  |
| 0.444 | 8858850045773080 | 10428981218043600 |  |
| 0.4445 | 8878813645180770 | 10456743563040600 |  |
| 0.445 | 8898799713467930 | 10484560258320200 |  |
| 0.4455 | 8918808250634560 | 10512431413965900 |  |
| 0.446 | 8938839256680660 | 10540357140427900 |  |
| 0.4465 | 8958892731606220 | 10568337548525200 |  |
| 0.447 | 8978968675411250 | 10596372749446400 |  |
| 0.4475 | 8999067088095750 | 10624462854751600 |  |
| 0.448 | 9019187969659730 | 10652607976373800 |  |
| 0.4485 | 9039331320103160 | 10680808226620200 |  |
| 0.449 | 9059497139426070 | 10709063718174100 |  |
| 0.4495 | 9079685427628450 | 10737374564095900 |  |
| 0.45 | 9099896184710290 | 10765740877825100 |  |
| 0.4505 | 9120129410671600 | 10794162773181800 |  |
| 0.451 | 9140385105512390 | 10822640364367600 |  |
| 0.4515 | 9160663269232640 | 10851173765968100 |  |
| 0.452 | 9180963901832350 | 10879763092953700 |  |
| 0.4525 | 9201287003311540 | 10908408460681600 |  |
| 0.453 | 9221632573670190 | 10937109984897000 |  |
| 0.4535 | 9242000612908320 | 10965867781735000 |  |
| 0.454 | 9262391121025910 | 10994681967722200 |  |
| 0.4545 | 9282804098022970 | 11023552659778000 |  |
| 0.455 | 9303239543899500 | 11052479975216400 |  |
| 0.4555 | 9323697458655490 | 11081464031747500 |  |
| 0.456 | 9344177842290960 | 11110504947479300 |  |
| 0.4565 | 9364680694805900 | 11139602840919200 |  |
| 0.457 | 9385206016200300 | 11168757830975600 |  |
| 0.4575 | 9405753806474170 | 11197970036959700 |  |
| 0.458 | 9426324065627500 | 11227239578586800 |  |
| 0.4585 | 9446916793660310 | 11256566575978600 |  |
| 0.459 | 9467531990572590 | 11285951149664100 |  |
| 0.4595 | 9488169656364330 | 11315393420581900 |  |
| 0.46 | 9508829791035540 | 11344893510081300 |  |
| 0.4605 | 9529512394586230 | 11374451539924900 |  |
| 0.461 | 9550217467016380 | 11404067632289000 |  |
| 0.4615 | 9570945008326000 | 11433741909766800 |  |
| 0.462 | 9591695018515080 | 11463474495368800 |  |
| 0.4625 | 9612467497583630 | 11493265512525200 |  |
| 0.463 | 9633262445531660 | 11523115085087800 |  |
| 0.4635 | 9654079862359150 | 11553023337331200 |  |
| 0.464 | 9674919748066110 | 11582990393954900 |  |
| 0.4645 | 9695782102652540 | 11613016380085000 |  |
| 0.465 | 9716666926118430 | 11643101421276100 |  |
| 0.4655 | 9737574218463800 | 11673245643512700 |  |
| 0.466 | 9758503979688630 | 11703449173211500 |  |
| 0.4665 | 9779456209792930 | 11733712137222700 |  |
| 0.467 | 9800430908776710 | 11764034662832300 |  |
| 0.4675 | 9821428076639940 | 11794416877763700 |  |
| 0.468 | 9842447713382650 | 11824858910179100 |  |
| 0.4685 | 9863489819004830 | 11855360888682200 |  |
| 0.469 | 9884554393506470 | 11885922942319500 |  |
| 0.4695 | 9905641436887580 | 11916545200582100 |  |
| 0.47 | 9926750949148170 | 11947227793407900 |  |
| 0.4705 | 9947882930288220 | 11977970851183100 |  |
| 0.471 | 9969037380307730 | 12008774504744600 |  |
| 0.4715 | 9990214299206720 | 12039638885381300 |  |
| 0.472 | 10011413686985200 | 12070564124836500 |  |
| 0.4725 | 10032635543643100 | 12101550355309500 |  |
| 0.473 | 10053879869180500 | 12132597709457600 |  |
| 0.4735 | 10075146663597300 | 12163706320398400 |  |
| 0.474 | 10096435926893700 | 12194876321711000 |  |
| 0.4745 | 10117747659069500 | 12226107847438700 |  |
| 0.475 | 10139081860124700 | 12257401032090600 |  |
| 0.4755 | 10160438530059500 | 12288756010643500 |  |
| 0.476 | 10181817668873700 | 12320172918544200 |  |
| 0.4765 | 10203219276567300 | 12351651891711300 |  |
| 0.477 | 10224643353140500 | 12383193066537100 |  |
| 0.4775 | 10246089898593100 | 12414796579890100 |  |
| 0.478 | 10267558912925200 | 12446462569116300 |  |
| 0.4785 | 10289050396136700 | 12478191172041800 |  |
| 0.479 | 10310564348227700 | 12509982526974900 |  |
| 0.4795 | 10332100769198200 | 12541836772707600 |  |
| 0.48 | 10353659659048200 | 12573754048518300 |  |
| 0.4805 | 10375241017777600 | 12605734494173600 |  |
| 0.481 | 10396844845386500 | 12637778249930200 |  |
| 0.4815 | 10418471141874800 | 12669885456537600 |  |
| 0.482 | 10440119907242600 | 12702056255239500 |  |
| 0.4825 | 10461791141489900 | 12734290787776400 |  |
| 0.483 | 10483484844616700 | 12766589196387800 |  |
| 0.4835 | 10505201016622900 | 12798951623814000 |  |
| 0.484 | 10526939657508600 | 12831378213298500 |  |
| 0.4845 | 10548700767273800 | 12863869108590100 |  |
| 0.485 | 10570484345918400 | 12896424453945100 |  |
| 0.4855 | 10592290393442500 | 12929044394129700 |  |
| 0.486 | 10614118909846100 | 12961729074421700 |  |
| 0.4865 | 10635969895129100 | 12994478640613400 |  |
| 0.487 | 10657843349291600 | 13027293239013400 |  |
| 0.4875 | 10679739272333600 | 13060173016448700 |  |
| 0.488 | 10701657664255100 | 13093118120267500 |  |
| 0.4885 | 10723598525056000 | 13126128698341100 |  |
| 0.489 | 10745561854736300 | 13159204899066300 |  |
| 0.4895 | 10767547653296200 | 13192346871367500 |  |
| 0.49 | 10789555920735500 | 13225554764699400 |  |
| 0.4905 | 10811586657054300 | 13258828729049000 |  |
| 0.491 | 10833639862252600 | 13292168914937900 |  |
| 0.4915 | 10855715536330300 | 13325575473425000 |  |
| 0.492 | 10877813679287500 | 13359048556108600 |  |
| 0.4925 | 10899934291124100 | 13392588315128700 |  |
| 0.493 | 10922077371840300 | 13426194903169700 |  |
| 0.4935 | 10944242921435900 | 13459868473462500 |  |
| 0.494 | 10966430939910900 | 13493609179787000 |  |
| 0.4945 | 10988641427265500 | 13527417176474500 |  |
| 0.495 | 11010874383499500 | 13561292618410300 |  |
| 0.4955 | 11033129808612900 | 13595235661036100 |  |
| 0.496 | 11055407702605900 | 13629246460352400 |  |
| 0.4965 | 11077708065478300 | 13663325172920700 |  |
| 0.497 | 11100030897230100 | 13697471955866600 |  |
| 0.4975 | 11122376197861500 | 13731686966882000 |  |
| 0.498 | 11144743967372300 | 13765970364227400 |  |
| 0.4985 | 11167134205762600 | 13800322306734800 |  |
| 0.499 | 11189546913032300 | 13834742953810100 |  |
| 0.4995 | 11211982089181600 | 13869232465435500 |  |
| 0.5 | 11234439734210200 | 13903791002172600 |  |
| 0.5005 | 11256919848118400 | 13938418725164300 |  |
| 0.501 | 11279422430906000 | 13973115796137900 |  |
| 0.5015 | 11301947482573100 | 14007882377407400 |  |
| 0.502 | 11324495003119700 | 14042718631876500 |  |
| 0.5025 | 11347064992545700 | 14077624723040900 |  |
| 0.503 | 11369657450851200 | 14112600814991400 |  |
| 0.5035 | 11392272378036100 | 14147647072415700 |  |
| 0.504 | 11414909774100600 | 14182763660602400 |  |
| 0.5045 | 11437569639044500 | 14217950745442400 |  |
| 0.505 | 11460251972867800 | 14253208493432700 |  |
| 0.5055 | 11482956775570700 | 14288537071678200 |  |
| 0.506 | 11505684047153000 | 14323936647895400 |  |
| 0.5065 | 11528433787614800 | 14359407390414200 |  |
| 0.507 | 11551205996956000 | 14394949468181600 |  |
| 0.5075 | 11574000675176700 | 14430563050763800 |  |
| 0.507999999999999 | 11596817822276900 | 14466248308349400 |  |
| 0.508499999999999 | 11619657438256500 | 14502005411752200 |  |
| 0.508999999999999 | 11642519523115600 | 14537834532413700 |  |
| 0.509499999999999 | 11665404076854200 | 14573735842406600 |  |
| 0.509999999999999 | 11688311099472300 | 14609709514437200 |  |
| 0.510499999999999 | 11711240590969800 | 14645755721848200 |  |
| 0.510999999999999 | 11734192551346800 | 14681874638622100 |  |
| 0.511499999999999 | 11757166980603200 | 14718066439383800 |  |
| 0.511999999999999 | 11780163878739200 | 14754331299403600 |  |
| 0.512499999999999 | 11803183245754600 | 14790669394600100 |  |
| 0.512999999999999 | 11826225081649400 | 14827080901543500 |  |
| 0.513499999999999 | 11849289386423800 | 14863565997458100 |  |
| 0.513999999999999 | 11872376160077600 | 14900124860225600 |  |
| 0.514499999999999 | 11895485402610800 | 14936757668388200 |  |
| 0.514999999999999 | 11918617114023600 | 14973464601151700 |  |
| 0.515499999999999 | 11941771294315800 | 15010245838388000 |  |
| 0.515999999999999 | 11964947943487400 | 15047101560639000 |  |
| 0.516499999999999 | 11988147061538600 | 15084031949119100 |  |
| 0.516999999999998 | 12011368648469200 | 15121037185718600 |  |
| 0.517499999999998 | 12034612704279300 | 15158117453006700 |  |
| 0.517999999999998 | 12057879228968800 | 15195272934234800 |  |
| 0.518499999999998 | 12081168222537800 | 15232503813339700 |  |
| 0.518999999999998 | 12104479684986300 | 15269810274946300 |  |
| 0.519499999999998 | 12127813616314300 | 15307192504371500 |  |
| 0.519999999999998 | 12151170016521700 | 15344650687627200 |  |
| 0.520499999999998 | 12174548885608600 | 15382185011423200 |  |
| 0.520999999999998 | 12197950223574900 | 15419795663170800 |  |
| 0.521499999999998 | 12221374030420800 | 15457482830986300 |  |
| 0.521999999999998 | 12244820306146100 | 15495246703693500 |  |
| 0.522499999999998 | 12268289050750800 | 15533087470828200 |  |
| 0.522999999999998 | 12291780264235000 | 15571005322640300 |  |
| 0.523499999999998 | 12315293946598700 | 15609000450098000 |  |
| 0.523999999999998 | 12338830097841900 | 15647073044891000 |  |
| 0.524499999999998 | 12362388717964500 | 15685223299433800 |  |
| 0.524999999999998 | 12385969806966700 | 15723451406869000 |  |
| 0.525499999999998 | 12409573364848200 | 15761757561071000 |  |
| 0.525999999999997 | 12433199391609300 | 15800141956649400 |  |
| 0.526499999999997 | 12456847887249800 | 15838604788952400 |  |
| 0.526999999999997 | 12480518851769800 | 15877146254070200 |  |
| 0.527499999999997 | 12504212285169200 | 15915766548838900 |  |
| 0.527999999999997 | 12527928187448100 | 15954465870843500 |  |
| 0.528499999999997 | 12551666558606500 | 15993244418422100 |  |
| 0.528999999999997 | 12575427398644400 | 16032102390668800 |  |
| 0.529499999999997 | 12599210707561700 | 16071039987438000 |  |
| 0.529999999999997 | 12623016485358500 | 16110057409347300 |  |
| 0.530499999999997 | 12646844732034700 | 16149154857781700 |  |
| 0.530999999999997 | 12670695447590400 | 16188332534897200 |  |
| 0.531499999999997 | 12694568632025600 | 16227590643624200 |  |
| 0.531999999999997 | 12718464285340300 | 16266929387671500 |  |
| 0.532499999999997 | 12742382407534400 | 16306348971529800 |  |
| 0.532999999999997 | 12766322998608000 | 16345849600475600 |  |
| 0.533499999999997 | 12790286058561100 | 16385431480575200 |  |
| 0.533999999999997 | 12814271587393600 | 16425094818687800 |  |
| 0.534499999999997 | 12838279585105600 | 16464839822470300 |  |
| 0.534999999999996 | 12862310051697100 | 16504666700380200 |  |
| 0.535499999999996 | 12886362987168100 | 16544575661680000 |  |
| 0.535999999999996 | 12910438391518500 | 16584566916441200 |  |
| 0.536499999999996 | 12934536264748300 | 16624640675547800 |  |
| 0.536999999999996 | 12958656606857700 | 16664797150700400 |  |
| 0.537499999999996 | 12982799417846500 | 16705036554420300 |  |
| 0.537999999999996 | 13006964697714800 | 16745359100053400 |  |
| 0.538499999999996 | 13031152446462500 | 16785765001774100 |  |
| 0.538999999999996 | 13055362664089800 | 16826254474589500 |  |
| 0.539499999999996 | 13079595350596400 | 16866827734343400 |  |
| 0.539999999999996 | 13103850505982600 | 16907484997720100 |  |
| 0.540499999999996 | 13128128130248200 | 16948226482249200 |  |
| 0.540999999999996 | 13152428223393300 | 16989052406309100 |  |
| 0.541499999999996 | 13176750785417900 | 17029962989131200 |  |
| 0.541999999999996 | 13201095816321900 | 17070958450804400 |  |
| 0.542499999999996 | 13225463316105400 | 17112039012279200 |  |
| 0.542999999999996 | 13249853284768400 | 17153204895371700 |  |
| 0.543499999999996 | 13274265722310800 | 17194456322768100 |  |
| 0.543999999999995 | 13298700628732700 | 17235793518029100 |  |
| 0.544499999999995 | 13323158004034100 | 17277216705593600 |  |
| 0.544999999999995 | 13347637848214900 | 17318726110783900 |  |
| 0.545499999999995 | 13372140161275200 | 17360321959809400 |  |
| 0.545999999999995 | 13396664943215000 | 17402004479771100 |  |
| 0.546499999999995 | 13421212194034300 | 17443773898666300 |  |
| 0.546999999999995 | 13445781913733000 | 17485630445392800 |  |
| 0.547499999999995 | 13470374102311200 | 17527574349753400 |  |
| 0.547999999999995 | 13494988759768800 | 17569605842460500 |  |
| 0.548499999999995 | 13519625886105900 | 17611725155140400 |  |
| 0.548999999999995 | 13544285481322500 | 17653932520338100 |  |
| 0.549499999999995 | 13568967545418600 | 17696228171521800 |  |
| 0.549999999999995 | 13593672078394100 | 17738612343087300 |  |
| 0.550499999999995 | 13618399080249100 | 17781085270363000 |  |
| 0.550999999999995 | 13643148550983600 | 17823647189614300 |  |
| 0.551499999999995 | 13667920490597500 | 17866298338048500 |  |
| 0.551999999999995 | 13692714899090900 | 17909038953819100 |  |
| 0.552499999999995 | 13717531776463800 | 17951869276031100 |  |
| 0.552999999999994 | 13742371122716100 | 17994789544745400 |  |
| 0.553499999999994 | 13767232937847900 | 18037800000983700 |  |
| 0.553999999999994 | 13792117221859200 | 18080900886733500 |  |
| 0.554499999999994 | 13817023974749900 | 18124092444952700 |  |
| 0.554999999999994 | 13841953196520100 | 18167374919574700 |  |
| 0.555499999999994 | 13866904887169800 | 18210748555513100 |  |
| 0.555999999999994 | 13891879046699000 | 18254213598667200 |  |
| 0.556499999999994 | 13916875675107600 | 18297770295926100 |  |
| 0.556999999999994 | 13941894772395700 | 18341418895174600 |  |
| 0.557499999999994 | 13966936338563200 | 18385159645297800 |  |
| 0.557999999999994 | 13992000373610200 | 18428992796186300 |  |
| 0.558499999999994 | 14017086877536700 | 18472918598741000 |  |
| 0.558999999999994 | 14042195850342700 | 18516937304879000 |  |
| 0.559499999999994 | 14067327292028100 | 18561049167537900 |  |
| 0.559999999999994 | 14092481202593000 | 18605254440681600 |  |
| 0.560499999999994 | 14117657582037300 | 18649553379305500 |  |
| 0.560999999999994 | 14142856430361200 | 18693946239441400 |  |
| 0.561499999999994 | 14168077747564500 | 18738433278163200 |  |
| 0.561999999999993 | 14193321533647200 | 18783014753592000 |  |
| 0.562499999999993 | 14218587788609500 | 18827690924901700 |  |
| 0.562999999999993 | 14243876512451200 | 18872462052324200 |  |
| 0.563499999999993 | 14269187705172400 | 18917328397155100 |  |
| 0.563999999999993 | 14294521366773000 | 18962290221758900 |  |
| 0.564499999999993 | 14319877497253100 | 19007347789574600 |  |
| 0.564999999999993 | 14345256096612700 | 19052501365121300 |  |
| 0.565499999999993 | 14370657164851700 | 19097751214003900 |  |
| 0.565999999999993 | 14396080701970200 | 19143097602918400 |  |
| 0.566499999999993 | 14421526707968200 | 19188540799658100 |  |
| 0.566999999999993 | 14446995182845700 | 19234081073118500 |  |
| 0.567499999999993 | 14472486126602600 | 19279718693303800 |  |
| 0.567999999999993 | 14497999539239000 | 19325453931332300 |  |
| 0.568499999999993 | 14523535420754800 | 19371287059442100 |  |
| 0.568999999999993 | 14549093771150200 | 19417218350997200 |  |
| 0.569499999999993 | 14574674590425000 | 19463248080493300 |  |
| 0.569999999999993 | 14600277878579200 | 19509376523563700 |  |
| 0.570499999999993 | 14625903635613000 | 19555603956985000 |  |
| 0.570999999999993 | 14651551861526200 | 19601930658683500 |  |
| 0.571499999999992 | 14677222556318800 | 19648356907741200 |  |
| 0.571999999999992 | 14702915719991000 | 19694882984401600 |  |
| 0.572499999999992 | 14728631352542600 | 19741509170075700 |  |
| 0.572999999999992 | 14754369453973600 | 19788235747348800 |  |
| 0.573499999999992 | 14780130024284200 | 19835062999986000 |  |
| 0.573999999999992 | 14805913063474200 | 19881991212938700 |  |
| 0.574499999999992 | 14831718571543700 | 19929020672351000 |  |
| 0.574999999999992 | 14857546548492600 | 19976151665565800 |  |
| 0.575499999999992 | 14883396994321000 | 20023384481131200 |  |
| 0.575999999999992 | 14909269909028900 | 20070719408806900 |  |
| 0.576499999999992 | 14935165292616300 | 20118156739570800 |  |
| 0.576999999999992 | 14961083145083100 | 20165696765625100 |  |
| 0.577499999999992 | 14987023466429400 | 20213339780403200 |  |
| 0.577999999999992 | 15012986256655100 | 20261086078576100 |  |
| 0.578499999999992 | 15038971515760300 | 20308935956058700 |  |
| 0.578999999999992 | 15064979243745000 | 20356889710017200 |  |
| 0.579499999999992 | 15091009440609200 | 20404947638875100 |  |
| 0.579999999999992 | 15117062106352800 | 20453110042320000 |  |
| 0.580499999999991 | 15143137240975900 | 20501377221310800 |  |
| 0.580999999999991 | 15169234844478500 | 20549749478084300 |  |
| 0.581499999999991 | 15195354916860500 | 20598227116161800 |  |
| 0.581999999999991 | 15221497458122000 | 20646810440356200 |  |
| 0.582499999999991 | 15247662468263000 | 20695499756779500 |  |
| 0.582999999999991 | 15273849947283400 | 20744295372848600 |  |
| 0.583499999999991 | 15300059895183400 | 20793197597293600 |  |
| 0.583999999999991 | 15326292311962700 | 20842206740164000 |  |
| 0.584499999999991 | 15352547197621600 | 20891323112836500 |  |
| 0.584999999999991 | 15378824552159900 | 20940547028021500 |  |
| 0.585499999999991 | 15405124375577700 | 20989878799771200 |  |
| 0.585999999999991 | 15431446667874900 | 21039318743486000 |  |
| 0.586499999999991 | 15457791429051700 | 21088867175922400 |  |
| 0.586999999999991 | 15484158659107800 | 21138524415200300 |  |
| 0.587499999999991 | 15510548358043500 | 21188290780810100 |  |
| 0.587999999999991 | 15536960525858600 | 21238166593620800 |  |
| 0.588499999999991 | 15563395162553200 | 21288152175886900 |  |
| 0.588999999999991 | 15589852268127300 | 21338247851256500 |  |
| 0.58949999999999 | 15616331842580800 | 21388453944778400 |  |
| 0.58999999999999 | 15642833885913800 | 21438770782910300 |  |
| 0.59049999999999 | 15669358398126300 | 21489198693526400 |  |
| 0.59099999999999 | 15695905379218200 | 21539738005924800 |  |
| 0.59149999999999 | 15722474829189600 | 21590389050836000 |  |
| 0.59199999999999 | 15749066748040500 | 21641152160430200 |  |
| 0.59249999999999 | 15775681135770800 | 21692027668325700 |  |
| 0.59299999999999 | 15802317992380600 | 21743015909596500 |  |
| 0.59349999999999 | 15828977317869900 | 21794117220780800 |  |
| 0.59399999999999 | 15855659112238700 | 21845331939888600 |  |
| 0.59449999999999 | 15882363375486900 | 21896660406410300 |  |
| 0.59499999999999 | 15909090107614500 | 21948102961324800 |  |
| 0.59549999999999 | 15935839308621700 | 21999659947107800 |  |
| 0.59599999999999 | 15962610978508300 | 22051331707739800 |  |
| 0.59649999999999 | 15989405117274400 | 22103118588715000 |  |
| 0.59699999999999 | 16016221724920000 | 22155020937049500 |  |
| 0.59749999999999 | 16043060801445000 | 22207039101289800 |  |
| 0.59799999999999 | 16069922346849500 | 22259173431521300 |  |
| 0.598499999999989 | 16096806361133400 | 22311424279377200 |  |
| 0.598999999999989 | 16123712844296900 | 22363791998046900 |  |
| 0.599499999999989 | 16150641796339800 | 22416276942284800 |  |
| 0.599999999999989 | 16177593217262100 | 22468879468419300 |  |
| 0.600499999999989 | 16204567107064000 | 22521599934361400 |  |
| 0.600999999999989 | 16231563465745300 | 22574438699613700 |  |
| 0.601499999999989 | 16258582293306100 | 22627396125279500 |  |
| 0.601999999999989 | 16285623589746300 | 22680472574071900 |  |
| 0.602499999999989 | 16312687355066000 | 22733668410322600 |  |
| 0.602999999999989 | 16339773589265200 | 22786983999991300 |  |
| 0.603499999999989 | 16366882292343800 | 22840419710674900 |  |
| 0.603999999999989 | 16394013464301900 | 22893975911617000 |  |
| 0.604499999999989 | 16421167105139500 | 22947652973716800 |  |
| 0.604999999999989 | 16448343214856600 | 23001451269539000 |  |
| 0.605499999999989 | 16475541793453100 | 23055371173323000 |  |
| 0.605999999999989 | 16502762840929100 | 23109413060992700 |  |
| 0.606499999999989 | 16530006357284500 | 23163577310166000 |  |
| 0.606999999999988 | 16557272342519500 | 23217864300164400 |  |
| 0.607499999999988 | 16584560796633900 | 23272274412023000 |  |
| 0.607999999999988 | 16611871719627700 | 23326808028500000 |  |
| 0.608499999999988 | 16639205111501000 | 23381465534087300 |  |
| 0.608999999999988 | 16666560972253800 | 23436247315019400 |  |
| 0.609499999999988 | 16693939301886100 | 23491153759284600 |  |
| 0.609999999999988 | 16721340100397800 | 23546185256634200 |  |
| 0.610499999999988 | 16748763367789000 | 23601342198593300 |  |
| 0.610999999999988 | 16776209104059700 | 23656624978470600 |  |
| 0.611499999999988 | 16803677309209900 | 23712033991369100 |  |
| 0.611999999999988 | 16831167983239500 | 23767569634196300 |  |
| 0.612499999999988 | 16858681126148500 | 23823232305674900 |  |
| 0.612999999999988 | 16886216737937100 | 23879022406353100 |  |
| 0.613499999999988 | 16913774818605100 | 23934940338615200 |  |
| 0.613999999999988 | 16941355368152600 | 23990986506692600 |  |
| 0.614499999999988 | 16968958386579500 | 24047161316674400 |  |
| 0.614999999999988 | 16996583873886000 | 24103465176518300 |  |
| 0.615499999999988 | 17024231830071800 | 24159898496061600 |  |
| 0.615999999999987 | 17051902255137200 | 24216461687032000 |  |
| 0.616499999999987 | 17079595149082000 | 24273155163058900 |  |
| 0.616999999999987 | 17107310511906300 | 24329979339684600 |  |
| 0.617499999999987 | 17135048343610100 | 24386934634375300 |  |
| 0.617999999999987 | 17162808644193300 | 24444021466532900 |  |
| 0.618499999999987 | 17190591413656000 | 24501240257505800 |  |
| 0.618999999999987 | 17218396651998200 | 24558591430601000 |  |
| 0.619499999999987 | 17246224359219800 | 24616075411095300 |  |
| 0.619999999999987 | 17274074535320900 | 24673692626247300 |  |
| 0.620499999999987 | 17301947180301500 | 24731443505308600 |  |
| 0.620999999999987 | 17329842294161500 | 24789328479536200 |  |
| 0.621499999999987 | 17357759876901000 | 24847347982204400 |  |
| 0.621999999999987 | 17385699928520000 | 24905502448616200 |  |
| 0.622499999999987 | 17413662449018500 | 24963792316116300 |  |
| 0.622999999999987 | 17441647438396400 | 25022218024102500 |  |
| 0.623499999999987 | 17469654896653800 | 25080780014038500 |  |
| 0.623999999999987 | 17497684823790600 | 25139478729465800 |  |
| 0.624499999999987 | 17525737219806900 | 25198314616016800 |  |
| 0.624999999999986 | 17553812084702700 | 25257288121426800 |  |
| 0.625499999999986 | 17581909418478000 | 25316399695546800 |  |
| 0.625999999999986 | 17610029221132700 | 25375649790356300 |  |
| 0.626499999999986 | 17638171492666900 | 25435038859976100 |  |
| 0.626999999999986 | 17666336233080500 | 25494567360681300 |  |
| 0.627499999999986 | 17694523442373700 | 25554235750914000 |  |
| 0.627999999999986 | 17722733120546300 | 25614044491297000 |  |
| 0.628499999999986 | 17750965267598300 | 25673994044646400 |  |
| 0.628999999999986 | 17779219883529900 | 25734084875985400 |  |
| 0.629499999999986 | 17807496968340900 | 25794317452557200 |  |
| 0.629999999999986 | 17835796522031400 | 25854692243839200 |  |
| 0.630499999999986 | 17864118544601300 | 25915209721555900 |  |
| 0.630999999999986 | 17892463036050700 | 25975870359693200 |  |
| 0.631499999999986 | 17920829996379600 | 26036674634511700 |  |
| 0.631999999999986 | 17949219425587900 | 26097623024561000 |  |
| 0.632499999999986 | 17977631323675700 | 26158716010693700 |  |
| 0.632999999999986 | 18006065690643000 | 26219954076079100 |  |
| 0.633499999999986 | 18034522526489800 | 26281337706218300 |  |
| 0.633999999999985 | 18063001831216000 | 26342867388957400 |  |
| 0.634499999999985 | 18091503604821700 | 26404543614503100 |  |
| 0.634999999999985 | 18120027847306800 | 26466366875436300 |  |
| 0.635499999999985 | 18148574558671500 | 26528337666727400 |  |
| 0.635999999999985 | 18177143738915600 | 26590456485750900 |  |
| 0.636499999999985 | 18205735388039100 | 26652723832300100 |  |
| 0.636999999999985 | 18234349506042100 | 26715140208602500 |  |
| 0.637499999999985 | 18262986092924600 | 26777706119334400 |  |
| 0.637999999999985 | 18291645148686600 | 26840422071636700 |  |
| 0.638499999999985 | 18320326673328000 | 26903288575129800 |  |
| 0.638999999999985 | 18349030666848900 | 26966306141929200 |  |
| 0.639499999999985 | 18377757129249300 | 27029475286661400 |  |
| 0.639999999999985 | 18406506060529200 | 27092796526479100 |  |
| 0.640499999999985 | 18435277460688500 | 27156270381077400 |  |
| 0.640999999999985 | 18464071329727200 | 27219897372709400 |  |
| 0.641499999999985 | 18492887667645500 | 27283678026202700 |  |
| 0.641999999999985 | 18521726474443200 | 27347612868975300 |  |
| 0.642499999999985 | 18550587750120400 | 27411702431052000 |  |
| 0.642999999999984 | 18579471494677000 | 27475947245080900 |  |
| 0.643499999999984 | 18608377708113200 | 27540347846349700 |  |
| 0.643999999999984 | 18637306390428700 | 27604904772802800 |  |
| 0.644499999999984 | 18666257541623800 | 27669618565058000 |  |
| 0.644999999999984 | 18695231161698300 | 27734489766423200 |  |
| 0.645499999999984 | 18724227250652300 | 27799518922913700 |  |
| 0.645999999999984 | 18753245808485800 | 27864706583269700 |  |
| 0.646499999999984 | 18782286835198700 | 27930053298973000 |  |
| 0.646999999999984 | 18811350330791100 | 27995559624265100 |  |
| 0.647499999999984 | 18840436295263000 | 28061226116164600 |  |
| 0.647999999999984 | 18869544728614300 | 28127053334484700 |  |
| 0.648499999999984 | 18898675630845100 | 28193041841851800 |  |
| 0.648999999999984 | 18927829001955400 | 28259192203722800 |  |
| 0.649499999999984 | 18957004841945100 | 28325504988403700 |  |
| 0.649999999999984 | 18986203150814300 | 28391980767067900 |  |
| 0.650499999999984 | 19015423928563000 | 28458620113774600 |  |
| 0.650999999999984 | 19044667175191100 | 28525423605487500 |  |
| 0.651499999999984 | 19073932890698800 | 28592391822093300 |  |
| 0.651999999999983 | 19103221075085800 | 28659525346421100 |  |
| 0.652499999999983 | 19132531728352400 | 28726824764261000 |  |
| 0.652999999999983 | 19161864850498400 | 28794290664383800 |  |
| 0.653499999999983 | 19191220441523900 | 28861923638559900 |  |
| 0.653999999999983 | 19220598501428900 | 28929724281579000 |  |
| 0.654499999999983 | 19249999030213300 | 28997693191270000 |  |
| 0.654999999999983 | 19279422027877200 | 29065830968520400 |  |
| 0.655499999999983 | 19308867494420500 | 29134138217296900 |  |
| 0.655999999999983 | 19338335429843400 | 29202615544664800 |  |
| 0.656499999999983 | 19367825834145700 | 29271263560809000 |  |
| 0.656999999999983 | 19397338707327400 | 29340082879054300 |  |
| 0.657499999999983 | 19426874049388700 | 29409074115885800 |  |
| 0.657999999999983 | 19456431860329400 | 29478237890969800 |  |
| 0.658499999999983 | 19486012140149500 | 29547574827175000 |  |
| 0.658999999999983 | 19515614888849200 | 29617085550593600 |  |
| 0.659499999999983 | 19545240106428300 | 29686770690562400 |  |
| 0.659999999999983 | 19574887792886900 | 29756630879684500 |  |
| 0.660499999999983 | 19604557948224900 | 29826666753850900 |  |
| 0.660999999999983 | 19634250572442400 | 29896878952262300 |  |
| 0.661499999999982 | 19663965665539400 | 29967268117451200 |  |
| 0.661999999999982 | 19693703227515900 | 30037834895304200 |  |
| 0.662499999999982 | 19723463258371800 | 30108579935084200 |  |
| 0.662999999999982 | 19753245758107200 | 30179503889452900 |  |
| 0.663499999999982 | 19783050726722000 | 30250607414493800 |  |
| 0.663999999999982 | 19812878164216300 | 30321891169735100 |  |
| 0.664499999999982 | 19842728070590100 | 30393355818172700 |  |
| 0.664999999999982 | 19872600445843400 | 30465002026293400 |  |
| 0.665499999999982 | 19902495289976100 | 30536830464099000 |  |
| 0.665999999999982 | 19932412602988300 | 30608841805129100 |  |
| 0.666499999999982 | 19962352384880000 | 30681036726485700 |  |
| 0.666999999999982 | 19992314635651100 | 30753415908857300 |  |
| 0.667499999999982 | 20022299355301700 | 30825980036542600 |  |
| 0.667999999999982 | 20052306543831800 | 30898729797475500 |  |
| 0.668499999999982 | 20082336201241300 | 30971665883249800 |  |
| 0.668999999999982 | 20112388327530300 | 31044788989143900 |  |
| 0.669499999999982 | 20142462922698800 | 31118099814145900 |  |
| 0.669999999999982 | 20172559986746800 | 31191599060979100 |  |
| 0.670499999999981 | 20202679519674200 | 31265287436127600 |  |
| 0.670999999999981 | 20232821521481100 | 31339165649861700 |  |
| 0.671499999999981 | 20262985992167400 | 31413234416264100 |  |
| 0.671999999999981 | 20293172931733200 | 31487494453256100 |  |
| 0.672499999999981 | 20323382340178500 | 31561946482623900 |  |
| 0.672999999999981 | 20353614217503300 | 31636591230045400 |  |
| 0.673499999999981 | 20383868563707500 | 31711429425116800 |  |
| 0.673999999999981 | 20414145378791200 | 31786461801379800 |  |
| 0.674499999999981 | 20444444662754300 | 31861689096349200 |  |
| 0.674999999999981 | 20474766415597000 | 31937112051539600 |  |
| 0.675499999999981 | 20505110637319100 | 32012731412494300 |  |
| 0.675999999999981 | 20535477327920600 | 32088547928812300 |  |
| 0.676499999999981 | 20565866487401700 | 32164562354177200 |  |
| 0.676999999999981 | 20596278115762200 | 32240775446385300 |  |
| 0.677499999999981 | 20626712213002100 | 32317187967374800 |  |
| 0.677999999999981 | 20657168779121600 | 32393800683254000 |  |
| 0.678499999999981 | 20687647814120500 | 32470614364331400 |  |
| 0.678999999999981 | 20718149317998900 | 32547629785144500 |  |
| 0.67949999999998 | 20748673290756700 | 32624847724489900 |  |
| 0.67999999999998 | 20779219732394000 | 32702268965453100 |  |
| 0.68049999999998 | 20809788642910800 | 32779894295438800 |  |
| 0.68099999999998 | 20840380022307100 | 32857724506201600 |  |
| 0.68149999999998 | 20870993870582800 | 32935760393876400 |  |
| 0.68199999999998 | 20901630187738000 | 33014002759009500 |  |
| 0.68249999999998 | 20932288973772600 | 33092452406590300 |  |
| 0.68299999999998 | 20962970228686700 | 33171110146082300 |  |
| 0.68349999999998 | 20993673952480300 | 33249976791455500 |  |
| 0.68399999999998 | 21024400145153400 | 33329053161218100 |  |
| 0.68449999999998 | 21055148806705900 | 33408340078448900 |  |
| 0.68499999999998 | 21085919937137900 | 33487838370830600 |  |
| 0.68549999999998 | 21116713536449400 | 33567548870681800 |  |
| 0.68599999999998 | 21147529604640300 | 33647472414991200 |  |
| 0.68649999999998 | 21178368141710700 | 33727609845450500 |  |
| 0.68699999999998 | 21209229147660600 | 33807962008488600 |  |
| 0.68749999999998 | 21240112622489900 | 33888529755305700 |  |
| 0.68799999999998 | 21271018566198700 | 33969313941907600 |  |
| 0.688499999999979 | 21301946978787000 | 34050315429140500 |  |
| 0.688999999999979 | 21332897860254800 | 34131535082726200 |  |
| 0.689499999999979 | 21363871210602000 | 34212973773297400 |  |
| 0.689999999999979 | 21394867029828700 | 34294632376433500 |  |
| 0.690499999999979 | 21425885317934800 | 34376511772696100 |  |
| 0.690999999999979 | 21456926074920400 | 34458612847666200 |  |
| 0.691499999999979 | 21487989300785500 | 34540936491979900 |  |
| 0.691999999999979 | 21519074995530100 | 34623483601366200 |  |
| 0.692499999999979 | 21550183159154100 | 34706255076683700 |  |
| 0.692999999999979 | 21581313791657600 | 34789251823958700 |  |
| 0.693499999999979 | 21612466893040600 | 34872474754422700 |  |
| 0.693999999999979 | 21643642463303000 | 34955924784551400 |  |
| 0.694499999999979 | 21674840502444900 | 35039602836102600 |  |
| 0.694999999999979 | 21706061010466200 | 35123509836155700 |  |
| 0.695499999999979 | 21737303987367100 | 35207646717151100 |  |
| 0.695999999999979 | 21768569433147400 | 35292014416929500 |  |
| 0.696499999999979 | 21799857347807200 | 35376613878772600 |  |
| 0.696999999999979 | 21831167731346400 | 35461446051443000 |  |
| 0.697499999999978 | 21862500583765100 | 35546511889225200 |  |
| 0.697999999999978 | 21893855905063300 | 35631812351967100 |  |
| 0.698499999999978 | 21925233695240900 | 35717348405121200 |  |
| 0.698999999999978 | 21956633954298000 | 35803121019786400 |  |
| 0.699499999999978 | 21988056682234600 | 35889131172750900 |  |
| 0.699999999999978 | 22019501879050700 | 35975379846534500 |  |
| 0.700499999999978 | 22050969544746200 | 36061868029431800 |  |
| 0.700999999999978 | 22082459679321200 | 36148596715555904 |  |
| 0.701499999999978 | 22113972282775600 | 36235566904881800 |  |
| 0.701999999999978 | 22145507355109500 | 36322779603291504 |  |
| 0.702499999999978 | 22177064896322900 | 36410235822618000 |  |
| 0.702999999999978 | 22208644906415800 | 36497936580690704 |  |
| 0.703499999999978 | 22240247385388100 | 36585882901381200 |  |
| 0.703999999999978 | 22271872333239900 | 36674075814648896 |  |
| 0.704499999999978 | 22303519749971200 | 36762516356587904 |  |
| 0.704999999999978 | 22335189635581900 | 36851205569473200 |  |
| 0.705499999999978 | 22366881990072100 | 36940144501808400 |  |
| 0.705999999999978 | 22398596813441800 | 37029334208373600 |  |
| 0.706499999999978 | 22430334105690900 | 37118775750273200 |  |
| 0.706999999999977 | 22462093866819500 | 37208470194984400 |  |
| 0.707499999999977 | 22493876096827600 | 37298418616406896 |  |
| 0.707999999999977 | 22525680795715200 | 37388622094912000 |  |
| 0.708499999999977 | 22557507963482200 | 37479081717392704 |  |
| 0.708999999999977 | 22589357600128700 | 37569798577314096 |  |
| 0.709499999999977 | 22621229705654600 | 37660773774764704 |  |
| 0.709999999999977 | 22653124280060000 | 37752008416507504 |  |
| 0.710499999999977 | 22685041323344900 | 37843503616031904 |  |
| 0.710999999999977 | 22716980835509300 | 37935260493606600 |  |
| 0.711499999999977 | 22748942816553100 | 38027280176332000 |  |
| 0.711999999999977 | 22780927266476400 | 38119563798194096 |  |
| 0.712499999999977 | 22812934185279200 | 38212112500118000 |  |
| 0.712999999999977 | 22844963572961400 | 38304927430022800 |  |
| 0.713499999999977 | 22877015429523100 | 38398009742876200 |  |
| 0.713999999999977 | 22909089754964200 | 38491360600750496 |  |
| 0.714499999999977 | 22941186549284900 | 38584981172878096 |  |
| 0.714999999999977 | 22973305812485000 | 38678872635708600 |  |
| 0.715499999999977 | 23005447544564500 | 38773036172965600 |  |
| 0.715999999999976 | 23037611745523600 | 38867472975704496 |  |
| 0.716499999999976 | 23069798415362100 | 38962184242371000 |  |
| 0.716999999999976 | 23102007554080100 | 39057171178859600 |  |
| 0.717499999999976 | 23134239161677500 | 39152434998573104 |  |
| 0.717999999999976 | 23166493238154400 | 39247976922482600 |  |
| 0.718499999999976 | 23198769783510800 | 39343798179188096 |  |
| 0.718999999999976 | 23231068797746700 | 39439900004979800 |  |
| 0.719499999999976 | 23263390280862000 | 39536283643899504 |  |
| 0.719999999999976 | 23295734232856800 | 39632950347803296 |  |
| 0.720499999999976 | 23328100653731000 | 39729901376424304 |  |
| 0.720999999999976 | 23360489543484700 | 39827137997436600 |  |
| 0.721499999999976 | 23392900902117900 | 39924661486519104 |  |
| 0.721999999999976 | 23425334729630600 | 40022473127420704 |  |
| 0.722499999999976 | 23457791026022700 | 40120574212025600 |  |
| 0.722999999999976 | 23490269791294300 | 40218966040419600 |  |
| 0.723499999999976 | 23522771025445400 | 40317649920956800 |  |
| 0.723999999999976 | 23555294728475900 | 40416627170327200 |  |
| 0.724499999999976 | 23587840900385900 | 40515899113624896 |  |
| 0.724999999999975 | 23620409541175400 | 40615467084416704 |  |
| 0.725499999999975 | 23653000650844300 | 40715332424811904 |  |
| 0.725999999999975 | 23685614229392700 | 40815496485532496 |  |
| 0.726499999999975 | 23718250276820600 | 40915960625984000 |  |
| 0.726999999999975 | 23750908793128000 | 41016726214327104 |  |
| 0.727499999999975 | 23783589778314800 | 41117794627550200 |  |
| 0.727999999999975 | 23816293232381100 | 41219167251542400 |  |
| 0.728499999999975 | 23849019155326800 | 41320845481167400 |  |
| 0.728999999999975 | 23881767547152000 | 41422830720338096 |  |
| 0.729499999999975 | 23914538407856700 | 41525124382091904 |  |
| 0.729999999999975 | 23947331737440900 | 41627727888666896 |  |
| 0.730499999999975 | 23980147535904500 | 41730642671578800 |  |
| 0.730999999999975 | 24012985803247600 | 41833870171698704 |  |
| 0.731499999999975 | 24045846539470100 | 41937411839331296 |  |
| 0.731999999999975 | 24078729744572200 | 42041269134294600 |  |
| 0.732499999999975 | 24111635418553700 | 42145443525999400 |  |
| 0.732999999999975 | 24144563561414600 | 42249936493531104 |  |
| 0.733499999999975 | 24177514173155100 | 42354749525730800 |  |
| 0.733999999999974 | 24210487253775000 | 42459884121278096 |  |
| 0.734499999999974 | 24243482803274300 | 42565341788774600 |  |
| 0.734999999999974 | 24276500821653200 | 42671124046828496 |  |
| 0.735499999999974 | 24309541308911500 | 42777232424139200 |  |
| 0.735999999999974 | 24342604265049300 | 42883668459584200 |  |
| 0.736499999999974 | 24375689690066500 | 42990433702305400 |  |
| 0.736999999999974 | 24408797583963200 | 43097529711797400 |  |
| 0.737499999999974 | 24441927946739400 | 43204958057996496 |  |
| 0.737999999999974 | 24475080778395000 | 43312720321369904 |  |
| 0.738499999999974 | 24508256078930200 | 43420818093007000 |  |
| 0.738999999999974 | 24541453848344800 | 43529252974710800 |  |
| 0.739499999999974 | 24574674086638800 | 43638026579090600 |  |
| 0.739999999999974 | 24607916793812300 | 43747140529655600 |  |
| 0.740499999999974 | 24641181969865300 | 43856596460909600 |  |
| 0.740999999999974 | 24674469614797800 | 43966396018446496 |  |
| 0.741499999999974 | 24707779728609700 | 44076540859047104 |  |
| 0.741999999999974 | 24741112311301100 | 44187032650776800 |  |
| 0.742499999999974 | 24774467362872000 | 44297873073083800 |  |
| 0.742999999999973 | 24807844883322300 | 44409063816899904 |  |
| 0.743499999999973 | 24841244872652100 | 44520606584740096 |  |
| 0.743999999999973 | 24874667330861400 | 44632503090805696 |  |
| 0.744499999999973 | 24908112257950100 | 44744755061086496 |  |
| 0.744999999999973 | 24941579653918300 | 44857364233465296 |  |
| 0.745499999999973 | 24975069518766000 | 44970332357823296 |  |
| 0.745999999999973 | 25008581852493100 | 45083661196145904 |  |
| 0.746499999999973 | 25042116655099800 | 45197352522631104 |  |
| 0.746999999999973 | 25075673926585800 | 45311408123797600 |  |
| 0.747499999999973 | 25109253666951400 | 45425829798595000 |  |
| 0.747999999999973 | 25142855876196400 | 45540619358514800 |  |
| 0.748499999999973 | 25176480554320900 | 45655778627702704 |  |
| 0.748999999999973 | 25210127701324800 | 45771309443072600 |  |
| 0.749499999999973 | 25243797317208300 | 45887213654420600 |  |
| 0.749999999999973 | 25277489401971200 | 46003493124541904 |  |
| 0.750499999999973 | 25311203955613500 | 46120149729347696 |  |
| 0.750999999999973 | 25344940978135400 | 46237185357983696 |  |
| 0.751499999999973 | 25378700469536600 | 46354601912950800 |  |
| 0.751999999999973 | 25412482429817400 | 46472401310225600 |  |
| 0.752499999999972 | 25446286858977600 | 46590585479383296 |  |
| 0.752999999999972 | 25480113757017300 | 46709156363722200 |  |
| 0.753499999999972 | 25513963123936500 | 46828115920388096 |  |
| 0.753999999999972 | 25547834959735200 | 46947466120502304 |  |
| 0.754499999999972 | 25581729264413300 | 47067208949288896 |  |
| 0.754999999999972 | 25615646037970800 | 47187346406204600 |  |
| 0.755499999999972 | 25649585280407900 | 47307880505070400 |  |
| 0.755999999999972 | 25683546991724400 | 47428813274203696 |  |
| 0.756499999999972 | 25717531171920400 | 47550146756552200 |  |
| 0.756999999999972 | 25751537820995800 | 47671883009830304 |  |
| 0.757499999999972 | 25785566938950700 | 47794024106655400 |  |
| 0.757999999999972 | 25819618525785100 | 47916572134687296 |  |
| 0.758499999999972 | 25853692581499000 | 48039529196767904 |  |
| 0.758999999999972 | 25887789106092300 | 48162897411063696 |  |
| 0.759499999999972 | 25921908099565100 | 48286678911209000 |  |
| 0.759999999999972 | 25956049561917400 | 48410875846450704 |  |
| 0.760499999999972 | 25990213493149100 | 48535490381796000 |  |
| 0.760999999999972 | 26024399893260300 | 48660524698160496 |  |
| 0.761499999999971 | 26058608762250900 | 48785980992518000 |  |
| 0.761999999999971 | 26092840100121100 | 48911861478053200 |  |
| 0.762499999999971 | 26127093906870700 | 49038168384315200 |  |
| 0.762999999999971 | 26161370182499800 | 49164903957372600 |  |
| 0.763499999999971 | 26195668927008300 | 49292070459971400 |  |
| 0.763999999999971 | 26229990140396300 | 49419670171694200 |  |
| 0.764499999999971 | 26264333822663800 | 49547705389120600 |  |
| 0.764999999999971 | 26298699973810700 | 49676178425990800 |  |
| 0.765499999999971 | 26333088593837100 | 49805091613369904 |  |
| 0.765999999999971 | 26367499682743000 | 49934447299815000 |  |
| 0.766499999999971 | 26401933240528400 | 50064247851544000 |  |
| 0.766999999999971 | 26436389267193200 | 50194495652605800 |  |
| 0.767499999999971 | 26470867762737500 | 50325193105053800 |  |
| 0.767999999999971 | 26505368727161200 | 50456342629120000 |  |
| 0.768499999999971 | 26539892160464400 | 50587946663392200 |  |
| 0.768999999999971 | 26574438062647100 | 50720007664993104 |  |
| 0.769499999999971 | 26609006433709300 | 50852528109761104 |  |
| 0.769999999999971 | 26643597273650900 | 50985510492433800 |  |
| 0.77049999999997 | 26678210582472000 | 51118957326833200 |  |
| 0.77099999999997 | 26712846360172600 | 51252871146054000 |  |
| 0.77149999999997 | 26747504606752600 | 51387254502652896 |  |
| 0.77199999999997 | 26782185322212100 | 51522109968841200 |  |
| 0.77249999999997 | 26816888506551100 | 51657440136679400 |  |
| 0.77299999999997 | 26851614159769500 | 51793247618273904 |  |
| 0.77349999999997 | 26886362281867400 | 51929535045976704 |  |
| 0.77399999999997 | 26921132872844800 | 52066305072586896 |  |
| 0.77449999999997 | 26955925932701700 | 52203560371554800 |  |
| 0.77499999999997 | 26990741461438000 | 52341303637189104 |  |
| 0.77549999999997 | 27025579459053700 | 52479537584865696 |  |
| 0.77599999999997 | 27060439925549000 | 52618264951239696 |  |
| 0.77649999999997 | 27095322860923700 | 52757488494459904 |  |
| 0.77699999999997 | 27130228265177900 | 52897210994385696 |  |
| 0.77749999999997 | 27165156138311500 | 53037435252807104 |  |
| 0.77799999999997 | 27200106480324700 | 53178164093666896 |  |
| 0.77849999999997 | 27235079291217300 | 53319400363286200 |  |
| 0.77899999999997 | 27270074570989300 | 53461146930592304 |  |
| 0.779499999999969 | 27305092319640900 | 53603406687349800 |  |
| 0.779999999999969 | 27340132537171800 | 53746182548394000 |  |
| 0.780499999999969 | 27375195223582300 | 53889477451868096 |  |
| 0.780999999999969 | 27410280378872200 | 54033294359462496 |  |
| 0.781499999999969 | 27445388003041700 | 54177636256657800 |  |
| 0.781999999999969 | 27480518096090500 | 54322506152970400 |  |
| 0.782499999999969 | 27515670658018900 | 54467907082201400 |  |
| 0.782999999999969 | 27550845688826700 | 54613842102688704 |  |
| 0.783499999999969 | 27586043188513900 | 54760314297562096 |  |
| 0.783999999999969 | 27621263157080700 | 54907326775002096 |  |
| 0.784499999999969 | 27656505594526900 | 55054882668501400 |  |
| 0.784999999999969 | 27691770500852600 | 55202985137130096 |  |
| 0.785499999999969 | 27727057876057700 | 55351637365804304 |  |
| 0.785999999999969 | 27762367720142300 | 55500842565558200 |  |
| 0.786499999999969 | 27797700033106400 | 55650603973819200 |  |
| 0.786999999999969 | 27833054814950000 | 55800924854687504 |  |
| 0.787499999999969 | 27868432065673000 | 55951808499218496 |  |
| 0.787999999999969 | 27903831785275500 | 56103258225709104 |  |
| 0.788499999999968 | 27939253973757500 | 56255277379987696 |  |
| 0.788999999999968 | 27974698631118900 | 56407869335708400 |  |
| 0.789499999999968 | 28010165757359800 | 56561037494648304 |  |
| 0.789999999999968 | 28045655352480100 | 56714785287009296 |  |
| 0.790499999999968 | 28081167416480000 | 56869116171723696 |  |
| 0.790999999999968 | 28116701949359300 | 57024033636763504 |  |
| 0.791499999999968 | 28152258951118000 | 57179541199454400 |  |
| 0.791999999999968 | 28187838421756300 | 57335642406793200 |  |
| 0.792499999999968 | 28223440361274000 | 57492340835770200 |  |
| 0.792999999999968 | 28259064769671200 | 57649640093695504 |  |
| 0.793499999999968 | 28294711646947800 | 57807543818529296 |  |
| 0.793999999999968 | 28330380993103900 | 57966055679217000 |  |
| 0.794499999999968 | 28366072808139500 | 58125179376029400 |  |
| 0.794999999999968 | 28401787092054600 | 58284918640905800 |  |
| 0.795499999999968 | 28437523844849100 | 58445277237803504 |  |
| 0.795999999999968 | 28473283066523100 | 58606258963051104 |  |
| 0.796499999999968 | 28509064757076500 | 58767867645706200 |  |
| 0.796999999999968 | 28544868916509400 | 58930107147919200 |  |
| 0.797499999999967 | 28580695544821800 | 59092981365300800 |  |
| 0.797999999999967 | 28616544642013700 | 59256494227295296 |  |
| 0.798499999999967 | 28652416208085000 | 59420649697558496 |  |
| 0.798999999999967 | 28688310243035800 | 59585451774340896 |  |
| 0.799499999999967 | 28724226746866100 | 59750904490876600 |  |
| 0.799999999999967 | 28760165719575800 | 59917011915776896 |  |
| 0.800499999999967 | 28796127161165000 | 60083778153429904 |  |
| 0.800999999999967 | 28832111071633700 | 60251207344404704 |  |
| 0.801499999999967 | 28868117450981800 | 60419303665862600 |  |
| 0.801999999999967 | 28904146299209400 | 60588071331972896 |  |
| 0.802499999999967 | 28940197616316500 | 60757514594334600 |  |
| 0.802999999999967 | 28976271402303000 | 60927637742404896 |  |
| 0.803499999999967 | 29012367657169100 | 61098445103932200 |  |
| 0.803999999999967 | 29048486380914500 | 61269941045396896 |  |
| 0.804499999999967 | 29084627573539500 | 61442129972456496 |  |
| 0.804999999999967 | 29120791235043900 | 61615016330399000 |  |
| 0.805499999999967 | 29156977365427800 | 61788604604601104 |  |
| 0.805999999999967 | 29193185964691100 | 61962899320993400 |  |
| 0.806499999999967 | 29229417032834000 | 62137905046532800 |  |
| 0.806999999999966 | 29265670569856300 | 62313626389681000 |  |
| 0.807499999999966 | 29301946575758000 | 62490068000889504 |  |
| 0.807999999999966 | 29338245050539200 | 62667234573092704 |  |
| 0.808499999999966 | 29374565994199900 | 62845130842207000 |  |
| 0.808999999999966 | 29410909406740100 | 63023761587637696 |  |
| 0.809499999999966 | 29447275288159700 | 63203131632792896 |  |
| 0.809999999999966 | 29483663638458800 | 63383245845605104 |  |
| 0.810499999999966 | 29520074457637400 | 63564109139059800 |  |
| 0.810999999999966 | 29556507745695400 | 63745726471733200 |  |
| 0.811499999999966 | 29592963502633000 | 63928102848335504 |  |
| 0.811999999999966 | 29629441728449900 | 64111243320264496 |  |
| 0.812499999999966 | 29665942423146400 | 64295152986165600 |  |
| 0.812999999999966 | 29702465586722300 | 64479836992501104 |  |
| 0.813499999999966 | 29739011219177700 | 64665300534127000 |  |
| 0.813999999999966 | 29775579320512500 | 64851548854879104 |  |
| 0.814499999999966 | 29812169890726800 | 65038587248167904 |  |
| 0.814999999999966 | 29848782929820600 | 65226421057581104 |  |
| 0.815499999999966 | 29885418437793900 | 65415055677496400 |  |
| 0.815999999999965 | 29922076414646600 | 65604496553703104 |  |
| 0.816499999999965 | 29958756860378800 | 65794749184032704 |  |
| 0.816999999999965 | 29995459774990400 | 65985819118999104 |  |
| 0.817499999999965 | 30032185158481600 | 66177711962448896 |  |
| 0.817999999999965 | 30068933010852200 | 66370433372220600 |  |
| 0.818499999999965 | 30105703332102200 | 66563989060815000 |  |
| 0.818999999999965 | 30142496122231800 | 66758384796074704 |  |
| 0.819499999999965 | 30179311381240800 | 66953626401874304 |  |
| 0.819999999999965 | 30216149109129200 | 67149719758821696 |  |
| 0.820499999999965 | 30253009305897200 | 67346670804969400 |  |
| 0.820999999999965 | 30289891971544600 | 67544485536536896 |  |
| 0.821499999999965 | 30326797106071500 | 67743170008644704 |  |
| 0.821999999999965 | 30363724709477800 | 67942730336058704 |  |
| 0.822499999999965 | 30400674781763600 | 68143172693947600 |  |
| 0.822999999999965 | 30437647322928900 | 68344503318650304 |  |
| 0.823499999999965 | 30474642332973600 | 68546728508456704 |  |
| 0.823999999999965 | 30511659811897900 | 68749854624400000 |  |
| 0.824499999999965 | 30548699759701500 | 68953888091061600 |  |
| 0.824999999999964 | 30585762176384700 | 69158835397388600 |  |
| 0.825499999999964 | 30622847061947300 | 69364703097523904 |  |
| 0.825999999999964 | 30659954416389400 | 69571497811650400 |  |
| 0.826499999999964 | 30697084239711000 | 69779226226847296 |  |
| 0.826999999999964 | 30734236531912000 | 69987895097961104 |  |
| 0.827499999999964 | 30771411292992500 | 70197511248489600 |  |
| 0.827999999999964 | 30808608522952400 | 70408081571480304 |  |
| 0.828499999999964 | 30845828221791900 | 70619613030444304 |  |
| 0.828999999999964 | 30883070389510800 | 70832112660282704 |  |
| 0.829499999999964 | 30920335026109200 | 71045587568230304 |  |
| 0.829999999999964 | 30957622131587000 | 71260044934812496 |  |
| 0.830499999999964 | 30994931705944300 | 71475492014819696 |  |
| 0.830999999999964 | 31032263749181100 | 71691936138295400 |  |
| 0.831499999999964 | 31069618261297300 | 71909384711542600 |  |
| 0.831999999999964 | 31106995242293000 | 72127845218145200 |  |
| 0.832499999999964 | 31144394692168200 | 72347325220006304 |  |
| 0.832999999999964 | 31181816610922900 | 72567832358404800 |  |
| 0.833499999999964 | 31219260998557000 | 72789374355067600 |  |
| 0.833999999999963 | 31256727855070600 | 73011959013260992 |  |
| 0.834499999999963 | 31294217180463600 | 73235594218899904 |  |
| 0.834999999999963 | 31331728974736100 | 73460287941675296 |  |
| 0.835499999999963 | 31369263237888100 | 73686048236200304 |  |
| 0.835999999999963 | 31406819969919600 | 73912883243176192 |  |
| 0.836499999999963 | 31444399170830500 | 74140801190577504 |  |
| 0.836999999999963 | 31482000840620900 | 74369810394857296 |  |
| 0.837499999999963 | 31519624979290800 | 74599919262172896 |  |
| 0.837999999999963 | 31557271586840100 | 74831136289631904 |  |
| 0.838499999999963 | 31594940663268900 | 75063470066560400 |  |
| 0.838999999999963 | 31632632208577200 | 75296929275791808 |  |
| 0.839499999999963 | 31670346222764900 | 75531522694978704 |  |
| 0.839999999999963 | 31708082705832100 | 75767259197926400 |  |
| 0.840499999999963 | 31745841657778800 | 76004147755950304 |  |
| 0.840999999999963 | 31783623078604900 | 76242197439255904 |  |
| 0.841499999999963 | 31821426968310600 | 76481417418343104 |  |
| 0.841999999999963 | 31859253326895600 | 76721816965435600 |  |
| 0.842499999999963 | 31897102154360200 | 76963405455934208 |  |
| 0.842999999999963 | 31934973450704200 | 77206192369896000 |  |
| 0.843499999999962 | 31972867215927700 | 77450187293539808 |  |
| 0.843999999999962 | 32010783450030600 | 77695399920777600 |  |
| 0.844499999999962 | 32048722153013100 | 77941840054773904 |  |
| 0.844999999999962 | 32086683324874900 | 78189517609531504 |  |
| 0.845499999999962 | 32124666965616300 | 78438442611507008 |  |
| 0.845999999999962 | 32162673075237100 | 78688625201253600 |  |
| 0.846499999999962 | 32200701653737400 | 78940075635094704 |  |
| 0.846999999999962 | 32238752701117200 | 79192804286826496 |  |
| 0.847499999999962 | 32276826217376400 | 79446821649452400 |  |
| 0.847999999999962 | 32314922202515100 | 79702138336947200 |  |
| 0.848499999999962 | 32353040656533300 | 79958765086055392 |  |
| 0.848999999999962 | 32391181579430900 | 80216712758120096 |  |
| 0.849499999999962 | 32429344971208000 | 80475992340947008 |  |
| 0.849999999999962 | 32467530831864600 | 80736614950701600 |  |
| 0.850499999999962 | 32505739161400700 | 80998591833841792 |  |
| 0.850999999999962 | 32543969959816200 | 81261934369085792 |  |
| 0.851499999999962 | 32582223227111200 | 81526654069416496 |  |
| 0.851999999999962 | 32620498963285600 | 81792762584123600 |  |
| 0.852499999999961 | 32658797168339500 | 82060271700883296 |  |
| 0.852999999999961 | 32697117842272900 | 82329193347876608 |  |
| 0.853499999999961 | 32735460985085800 | 82599539595948400 |  |
| 0.853999999999961 | 32773826596778100 | 82871322660806096 |  |
| 0.854499999999961 | 32812214677349900 | 83144554905260800 |  |
| 0.854999999999961 | 32850625226801100 | 83419248841510096 |  |
| 0.855499999999961 | 32889058245131900 | 83695417133464608 |  |
| 0.855999999999961 | 32927513732342000 | 83973072599119504 |  |
| 0.856499999999961 | 32965991688431700 | 84252228212970704 |  |
| 0.856999999999961 | 33004492113400800 | 84532897108477600 |  |
| 0.857499999999961 | 33043015007249400 | 84815092580574000 |  |
| 0.857999999999961 | 33081560369977500 | 85098828088226800 |  |
| 0.858499999999961 | 33120128201585100 | 85384117257044992 |  |
| 0.858999999999961 | 33158718502072100 | 85670973881939296 |  |
| 0.859499999999961 | 33197331271438500 | 85959411929833904 |  |
| 0.859999999999961 | 33235966509684500 | 86249445542431296 |  |
| 0.860499999999961 | 33274624216809900 | 86541089039032000 |  |
| 0.860999999999961 | 33313304392814800 | 86834356919409696 |  |
| 0.86149999999996 | 33352007037699100 | 87129263866743296 |  |
| 0.86199999999996 | 33390732151462900 | 87425824750608096 |  |
| 0.86249999999996 | 33429479734106200 | 87724054630026096 |  |
| 0.86299999999996 | 33468249785629000 | 88023968756577696 |  |
| 0.86349999999996 | 33507042306031200 | 88325582577576400 |  |
| 0.86399999999996 | 33545857295312900 | 88628911739307200 |  |
| 0.86449999999996 | 33584694753474000 | 88933972090330704 |  |
| 0.86499999999996 | 33623554680514700 | 89240779684855504 |  |
| 0.86549999999996 | 33662437076434800 | 89549350786177696 |  |
| 0.86599999999996 | 33701341941234300 | 89859701870192896 |  |
| 0.86649999999996 | 33740269274913400 | 90171849628979296 |  |
| 0.86699999999996 | 33779219077471900 | 90485810974454800 |  |
| 0.86749999999996 | 33818191348909800 | 90801603042111296 |  |
| 0.86799999999996 | 33857186089227300 | 91119243194824992 |  |
| 0.86849999999996 | 33896203298424200 | 91438749026747600 |  |
| 0.86899999999996 | 33935242976500500 | 91760138367279008 |  |
| 0.86949999999996 | 33974305123456400 | 92083429285122800 |  |
| 0.86999999999996 | 34013389739291700 | 92408640092428992 |  |
| 0.870499999999959 | 34052496824006500 | 92735789349023600 |  |
| 0.870999999999959 | 34091626377600700 | 93064895866728192 |  |
| 0.871499999999959 | 34130778400074400 | 93395978713773104 |  |
| 0.871999999999959 | 34169952891427600 | 93729057219304096 |  |
| 0.872499999999959 | 34209149851660300 | 94064150977987008 |  |
| 0.872999999999959 | 34248369280772400 | 94401279854711600 |  |
| 0.873499999999959 | 34287611178764000 | 94740463989398208 |  |
| 0.873999999999959 | 34326875545635100 | 95081723801908304 |  |
| 0.874499999999959 | 34366162381385600 | 95425079997064000 |  |
| 0.874999999999959 | 34405471686015600 | 95770553569776000 |  |
| 0.875499999999959 | 34444803459525000 | 96118165810287296 |  |
| 0.875999999999959 | 34484157701914000 | 96467938309530592 |  |
| 0.876499999999959 | 34523534413182400 | 96819892964607008 |  |
| 0.876999999999959 | 34562933593330200 | 97174051984385408 |  |
| 0.877499999999959 | 34602355242357600 | 97530437895228992 |  |
| 0.877999999999959 | 34641799360264400 | 97889073546850400 |  |
| 0.878499999999959 | 34681265947050700 | 98249982118298400 |  |
| 0.878999999999959 | 34720755002716400 | 98613187124081696 |  |
| 0.879499999999958 | 34760266527261600 | 98978712420432096 |  |
| 0.879999999999958 | 34799800520686300 | 99346582211711008 |  |
| 0.880499999999958 | 34839356982990400 | 99716821056963392 |  |
| 0.880999999999958 | 34878935914174100 | 100089453876623008 |  |
| 0.881499999999958 | 34918537314237100 | 100464505959372992 |  |
| 0.881999999999958 | 34958161183179700 | 100842002969168000 |  |
| 0.882499999999958 | 34997807521001700 | 101221970952416992 |  |
| 0.882999999999958 | 35037476327703200 | 101604436345338000 |  |
| 0.883499999999958 | 35077167603284200 | 101989425981484992 |  |
| 0.883999999999958 | 35116881347744600 | 102376967099456000 |  |
| 0.884499999999958 | 35156617561084500 | 102767087350776000 |  |
| 0.884999999999958 | 35196376243303900 | 103159814807982000 |  |
| 0.885499999999958 | 35236157394402700 | 103555177972888992 |  |
| 0.885999999999958 | 35275961014381000 | 103953205785062000 |  |
| 0.886499999999958 | 35315787103238800 | 104353927630494000 |  |
| 0.886999999999958 | 35355635660976000 | 104757373350488992 |  |
| 0.887499999999958 | 35395506687592700 | 105163573250772000 |  |
| 0.887999999999958 | 35435400183088900 | 105572558110811008 |  |
| 0.888499999999957 | 35475316147464500 | 105984359193376000 |  |
| 0.888999999999957 | 35515254580719600 | 106399008254336000 |  |
| 0.889499999999957 | 35555215482854200 | 106816537552692000 |  |
| 0.889999999999957 | 35595198853868200 | 107236979860868992 |  |
| 0.890499999999957 | 35635204693761800 | 107660368475262000 |  |
| 0.890999999999957 | 35675233002534800 | 108086737227047008 |  |
| 0.891499999999957 | 35715283780187200 | 108516120493271008 |  |
| 0.891999999999957 | 35755357026719100 | 108948553208216992 |  |
| 0.892499999999957 | 35795452742130500 | 109384070875064992 |  |
| 0.892999999999957 | 35835570926421400 | 109822709577851008 |  |
| 0.893499999999957 | 35875711579591700 | 110264505993734000 |  |
| 0.893999999999957 | 35915874701641500 | 110709497405582000 |  |
| 0.894499999999957 | 35956060292570800 | 111157721714884000 |  |
| 0.894999999999957 | 35996268352379500 | 111609217455004000 |  |
| 0.895499999999957 | 36036498881067696 | 112064023804776000 |  |
| 0.895999999999957 | 36076751878635400 | 112522180602468992 |  |
| 0.896499999999957 | 36117027345082496 | 112983728360111008 |  |
| 0.896999999999957 | 36157325280409104 | 113448708278208000 |  |
| 0.897499999999956 | 36197645684615200 | 113917162260842000 |  |
| 0.897999999999956 | 36237988557700704 | 114389132931192992 |  |
| 0.898499999999956 | 36278353899665696 | 114864663647466000 |  |
| 0.898999999999956 | 36318741710510200 | 115343798519262000 |  |
| 0.899499999999956 | 36359151990234200 | 115826582424392000 |  |
| 0.899999999999956 | 36399584738837600 | 116313061026150000 |  |
| 0.900499999999956 | 36440039956320496 | 116803280791075008 |  |
| 0.900999999999956 | 36480517642682800 | 117297289007188000 |  |
| 0.901499999999956 | 36521017797924600 | 117795133802754000 |  |
| 0.901999999999956 | 36561540422045904 | 118296864165562000 |  |
| 0.902499999999956 | 36602085515046704 | 118802529962750000 |  |
| 0.902999999999956 | 36642653076926896 | 119312181961188992 |  |
| 0.903499999999956 | 36683243107686600 | 119825871848456000 |  |
| 0.903999999999956 | 36723855607325800 | 120343652254394000 |  |
| 0.904499999999956 | 36764490575844400 | 120865576773306000 |  |
| 0.904999999999956 | 36805148013242496 | 121391699986780000 |  |
| 0.905499999999956 | 36845827919520096 | 121922077487184992 |  |
| 0.905999999999956 | 36886530294677104 | 122456765901850000 |  |
| 0.906499999999956 | 36927255138713600 | 122995822917954000 |  |
| 0.906999999999955 | 36968002451629600 | 123539307308154000 |  |
| 0.907499999999955 | 37008772233425000 | 124087278956968000 |  |
| 0.907999999999955 | 37049564484099904 | 124639798887956992 |  |
| 0.908499999999955 | 37090379203654304 | 125196929291708000 |  |
| 0.908999999999955 | 37131216392088200 | 125758733554678000 |  |
| 0.909499999999955 | 37172076049401504 | 126325276288900000 |  |
| 0.909999999999955 | 37212958175594304 | 126896623362604000 |  |
| 0.910499999999955 | 37253862770666496 | 127472841931778000 |  |
| 0.910999999999955 | 37294789834618200 | 128054000472695008 |  |
| 0.911499999999955 | 37335739367449400 | 128640168815463008 |  |
| 0.911999999999955 | 37376711369160096 | 129231418178608992 |  |
| 0.912499999999955 | 37417705839750200 | 129827821204760992 |  |
| 0.912999999999955 | 37458722779219800 | 130429451997443008 |  |
| 0.913499999999955 | 37499762187568896 | 131036386159055008 |  |
| 0.913999999999955 | 37540824064797400 | 131648700830052000 |  |
| 0.914499999999955 | 37581908410905400 | 132266474729388992 |  |
| 0.914999999999955 | 37623015225892896 | 132889788196272000 |  |
| 0.915499999999955 | 37664144509759800 | 133518723233267008 |  |
| 0.915999999999954 | 37705296262506200 | 134153363550816000 |  |
| 0.916499999999954 | 37746470484132096 | 134793794613220992 |  |
| 0.916999999999954 | 37787667174637400 | 135440103686147008 |  |
| 0.917499999999954 | 37828886334022200 | 136092379885710000 |  |
| 0.917999999999954 | 37870127962286496 | 136750714229206000 |  |
| 0.918499999999954 | 37911392059430304 | 137415199687552000 |  |
| 0.918999999999954 | 37952678625453504 | 138085931239503008 |  |
| 0.919499999999954 | 37993987660356200 | 138763005927726000 |  |
| 0.919999999999954 | 38035319164138304 | 139446522916786000 |  |
| 0.920499999999954 | 38076673136799904 | 140136583553152000 |  |
| 0.920999999999954 | 38118049578341000 | 140833291427276992 |  |
| 0.921499999999954 | 38159448488761600 | 141536752437852000 |  |
| 0.921999999999954 | 38200869868061600 | 142247074858328992 |  |
| 0.922499999999954 | 38242313716241104 | 142964369405798000 |  |
| 0.922999999999954 | 38283780033300096 | 143688749312315008 |  |
| 0.923499999999954 | 38325268819238496 | 144420330398803008 |  |
| 0.923999999999954 | 38366780074056400 | 145159231151612000 |  |
| 0.924499999999954 | 38408313797753800 | 145905572801872992 |  |
| 0.924999999999953 | 38449869990330600 | 146659479407752000 |  |
| 0.925499999999953 | 38491448651786896 | 147421077939737984 |  |
| 0.925999999999953 | 38533049782122704 | 148190498369100000 |  |
| 0.926499999999953 | 38574673381337904 | 148967873759643008 |  |
| 0.926999999999953 | 38616319449432600 | 149753340362921984 |  |
| 0.927499999999953 | 38657987986406800 | 150547037717056000 |  |
| 0.927999999999953 | 38699678992260496 | 151349108749319008 |  |
| 0.928499999999953 | 38741392466993600 | 152159699882667008 |  |
| 0.928999999999953 | 38783128410606200 | 152978961146380992 |  |
| 0.929499999999953 | 38824886823098200 | 153807046291032000 |  |
| 0.929999999999953 | 38866667704469696 | 154644112907942016 |  |
| 0.930499999999953 | 38908471054720704 | 155490322553376992 |  |
| 0.930999999999953 | 38950296873851200 | 156345840877673984 |  |
| 0.931499999999953 | 38992145161861104 | 157210837759550016 |  |
| 0.931999999999953 | 39034015918750496 | 158085487445830016 |  |
| 0.932499999999953 | 39075909144519400 | 158969968696865984 |  |
| 0.932999999999953 | 39117824839167696 | 159864464937905984 |  |
| 0.933499999999953 | 39159763002695504 | 160769164416721984 |  |
| 0.933999999999953 | 39201723635102800 | 161684260367792992 |  |
| 0.934499999999952 | 39243706736389504 | 162609951183364000 |  |
| 0.934999999999952 | 39285712306555696 | 163546440591745984 |  |
| 0.935499999999952 | 39327740345601400 | 164493937843187008 |  |
| 0.935999999999952 | 39369790853526496 | 165452657903731008 |  |
| 0.936499999999952 | 39411863830331104 | 166422821657455008 |  |
| 0.936999999999952 | 39453959276015200 | 167404656117515008 |  |
| 0.937499999999952 | 39496077190578800 | 168398394646468992 |  |
| 0.937999999999952 | 39538217574021800 | 169404277186351008 |  |
| 0.938499999999952 | 39580380426344304 | 170422550499020000 |  |
| 0.938999999999952 | 39622565747546200 | 171453468417320000 |  |
| 0.939499999999952 | 39664773537627600 | 172497292107644992 |  |
| 0.939999999999952 | 39707003796588496 | 173554290344505984 |  |
| 0.940499999999952 | 39749256524428896 | 174624739797777984 |  |
| 0.940999999999952 | 39791531721148704 | 175708925333303008 |  |
| 0.941499999999952 | 39833829386748000 | 176807140327598016 |  |
| 0.941999999999952 | 39876149521226800 | 177919686997464992 |  |
| 0.942499999999952 | 39918492124585000 | 179046876745328000 |  |
| 0.942999999999952 | 39960857196822704 | 180189030521204000 |  |
| 0.943499999999951 | 40003244737939904 | 181346479202256992 |  |
| 0.943999999999951 | 40045654747936496 | 182519563990953984 |  |
| 0.944499999999951 | 40088087226812600 | 183708636832916000 |  |
| 0.944999999999951 | 40130542174568200 | 184914060855615008 |  |
| 0.945499999999951 | 40173019591203200 | 186136210829164992 |  |
| 0.945999999999951 | 40215519476717696 | 187375473650537984 |  |
| 0.946499999999951 | 40258041831111696 | 188632248852604992 |  |
| 0.946999999999951 | 40300586654385200 | 189906949139553984 |  |
| 0.947499999999951 | 40343153946538096 | 191200000950278016 |  |
| 0.947999999999951 | 40385743707570496 | 192511845051507008 |  |
| 0.948499999999951 | 40428355937482304 | 193842937162540000 |  |
| 0.948999999999951 | 40470990636273600 | 195193748613587008 |  |
| 0.949499999999951 | 40513647803944400 | 196564767039896000 |  |
| 0.949999999999951 | 40556327440494704 | 197956497113956000 |  |
| 0.950499999999951 | 40599029545924400 | 199369461318299008 |  |
| 0.950999999999951 | 40641754120233600 | 200804200761575008 |  |
| 0.951499999999951 | 40684501163422304 | 202261276040785984 |  |
| 0.951999999999951 | 40727270675490400 | 203741268152809984 |  |
| 0.95249999999995 | 40770062656438000 | 205244779458572992 |  |
| 0.95299999999995 | 40812877106265104 | 206772434703504000 |  |
| 0.95349999999995 | 40855714024971600 | 208324882098185984 |  |
| 0.95399999999995 | 40898573412557600 | 209902794463460992 |  |
| 0.95449999999995 | 40941455269023104 | 211506870444575008 |  |
| 0.95499999999995 | 40984359594368000 | 213137835799326016 |  |
| 0.95549999999995 | 41027286388592400 | 214796444765627008 |  |
| 0.95599999999995 | 41070235651696304 | 216483481514312992 |  |
| 0.95649999999995 | 41113207383679696 | 218199761693558016 |  |
| 0.95699999999995 | 41156201584542496 | 219946134071800992 |  |
| 0.95749999999995 | 41199218254284800 | 221723482286696000 |  |
| 0.95799999999995 | 41242257392906496 | 223532726708264992 |  |
| 0.95849999999995 | 41285319000407696 | 225374826425176000 |  |
| 0.95899999999995 | 41328403076788400 | 227250781363875008 |  |
| 0.95949999999995 | 41371509622048600 | 229161634551203008 |  |
| 0.95999999999995 | 41414638636188200 | 231108474532127008 |  |
| 0.96049999999995 | 41457790119207296 | 233092437955296992 |  |
| 0.96099999999995 | 41500964071105904 | 235114712340392992 |  |
| 0.961499999999949 | 41544160491883904 | 237176539042536992 |  |
| 0.961999999999949 | 41587379381541400 | 239279216430596000 |  |
| 0.962499999999949 | 41630620740078400 | 241424103297833984 |  |
| 0.962999999999949 | 41673884567494800 | 243612622525272992 |  |
| 0.963499999999949 | 41717170863790704 | 245846265020185984 |  |
| 0.963999999999949 | 41760479628966096 | 248126593954478016 |  |
| 0.964499999999949 | 41803810863020896 | 250455249330316992 |  |
| 0.964999999999949 | 41847164565955200 | 252833952903311008 |  |
| 0.965499999999949 | 41890540737769000 | 255264513496780000 |  |
| 0.965999999999949 | 41933939378462304 | 257748832744395008 |  |
| 0.966499999999949 | 41977360488035000 | 260288911302584000 |  |
| 0.966999999999949 | 42020804066487200 | 262886855578808000 |  |
| 0.967499999999949 | 42064270113818800 | 265544885027111008 |  |
| 0.967999999999949 | 42107758630029904 | 268265340068332000 |  |
| 0.968499999999949 | 42151269615120496 | 271050690699199008 |  |
| 0.968999999999949 | 42194803069090600 | 273903545862249984 |  |
| 0.969499999999949 | 42238358991940096 | 276826663657320992 |  |
| 0.969999999999949 | 42281937383669104 | 279822962485441984 |  |
| 0.970499999999948 | 42325538244277600 | 282895533227408000 |  |
| 0.970999999999948 | 42369161573765504 | 286047652572552992 |  |
| 0.971499999999948 | 42412807372132896 | 289282797628300992 |  |
| 0.971999999999948 | 42456475639379800 | 292604661958553984 |  |
| 0.972499999999948 | 42500166375506096 | 296017173219041024 |  |
| 0.972999999999948 | 42543879580511904 | 299524512580998016 |  |
| 0.973499999999948 | 42587615254397200 | 303131136161539008 |  |
| 0.973999999999948 | 42631373397161904 | 306841798710380992 |  |
| 0.974499999999948 | 42675154008806096 | 310661579839187008 |  |
| 0.974999999999948 | 42718957089329800 | 314595913122462976 |  |
| 0.975499999999948 | 42762782638733000 | 318650618449091968 |  |
| 0.975999999999948 | 42806630657015600 | 322831938062520000 |  |
| 0.976499999999948 | 42850501144177696 | 327146576797126016 |  |
| 0.976999999999948 | 42894394100219200 | 331601747100654016 |  |
| 0.977499999999948 | 42938309525140200 | 336205219530360000 |  |
| 0.977999999999948 | 42982247418940704 | 340965379527132032 |  |
| 0.978499999999948 | 43026207781620704 | 345891291411289984 |  |
| 0.978999999999948 | 43070190613180096 | 350992770711404992 |  |
| 0.979499999999947 | 43114195913619000 | 356280466139518976 |  |
| 0.979999999999947 | 43158223682937296 | 361765952771008000 |  |
| 0.980499999999947 | 43202273921135200 | 367461838285097984 |  |
| 0.980999999999947 | 43246346628212496 | 373381884486126976 |  |
| 0.981499999999947 | 43290441804169296 | 379541146772732992 |  |
| 0.981999999999947 | 43334559449005504 | 385956134774179008 |  |
| 0.982499999999947 | 43378699562721200 | 392644998058134016 |  |
| 0.982999999999947 | 43422862145316400 | 399627741669526976 |  |
| 0.983499999999947 | 43467047196791000 | 406926477333992000 |  |
| 0.983999999999947 | 43511254717145104 | 414565717516596992 |  |
| 0.984499999999947 | 43555484706378704 | 422572721252921984 |  |
| 0.984999999999947 | 43599737164491696 | 430977902881280000 |  |
| 0.985499999999947 | 43644012091484304 | 439815317659601024 |  |
| 0.985999999999947 | 43688309487356304 | 449123241964576000 |  |
| 0.986499999999947 | 43732629352107696 | 458944870643790976 |  |
| 0.986999999999947 | 43776971685738600 | 469329160543632000 |  |
| 0.987499999999947 | 43821336488249000 | 480331857860809984 |  |
| 0.987999999999947 | 43865723759638896 | 492016758615769984 |  |
| 0.988499999999946 | 43910133499908200 | 504457267458387008 |  |
| 0.988999999999946 | 43954565709057000 | 517738342011971968 |  |
| 0.989499999999946 | 43999020387085200 | 531958940761913024 |  |
| 0.989999999999946 | 44043497533993000 | 547235136235056000 |  |
| 0.990499999999946 | 44087997149780200 | 563704118286998976 |  |
| 0.990999999999946 | 44132519234446800 | 581529404790514944 |  |
| 0.991499999999946 | 44177063787993000 | 600907715112765056 |  |
| 0.991999999999946 | 44221630810418600 | 622078172186409984 |  |
| 0.992499999999946 | 44266220301723696 | 645334826840535040 |  |
| 0.992999999999946 | 44310832261908200 | 671044021788061056 |  |
| 0.993499999999946 | 44355466690972200 | 699668972968402944 |  |
| 0.993999999999946 | 44400123588915696 | 731805404400845952 |  |
| 0.994499999999946 | 44444802955738600 | 768234635699117056 |  |
| 0.994999999999946 | 44489504791441000 | 810005215687216000 |  |
| 0.995499999999946 | 44534229096022896 | 858563217784976000 |  |
| 0.995999999999946 | 44578975869484304 | 915969668124406016 |  |
| 0.996499999999946 | 44623745111825104 | 985283560670274944 |  |
| 0.996999999999946 | 44668536823045400 | 1071283624815789952 |  |
| 0.997499999999945 | 44713351003145200 | 1181951385508839936 |  |
| 0.997999999999945 | 44758187652124400 | 1331892255643660032 |  |
| 0.998499999999945 | 44803046769983104 | 1551635114274720000 |  |
| 0.998999999999945 | 44847928356721200 | 1920304764761469952 |  |
| 0.999499999999945 | 44892832412338896 | 2752593236454859776 |  |
| 0.999999999999945 | 44937758936836000 | 271642481890254997422080 |  |